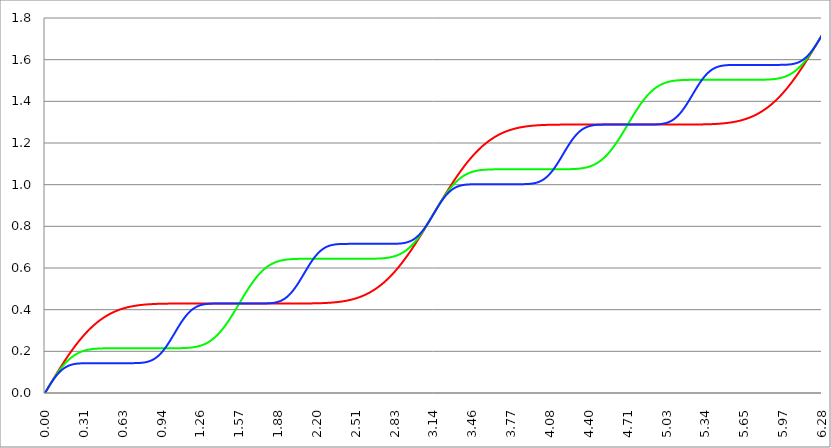
| Category | Series 1 | Series 0 | Series 2 |
|---|---|---|---|
| 0.0 | 0 | 0 | 0 |
| 0.00314159265358979 | 0.003 | 0.003 | 0.003 |
| 0.00628318530717958 | 0.006 | 0.006 | 0.006 |
| 0.00942477796076938 | 0.009 | 0.009 | 0.009 |
| 0.0125663706143592 | 0.013 | 0.013 | 0.013 |
| 0.015707963267949 | 0.016 | 0.016 | 0.016 |
| 0.0188495559215388 | 0.019 | 0.019 | 0.019 |
| 0.0219911485751285 | 0.022 | 0.022 | 0.022 |
| 0.0251327412287183 | 0.025 | 0.025 | 0.025 |
| 0.0282743338823081 | 0.028 | 0.028 | 0.028 |
| 0.0314159265358979 | 0.031 | 0.031 | 0.031 |
| 0.0345575191894877 | 0.035 | 0.034 | 0.034 |
| 0.0376991118430775 | 0.038 | 0.037 | 0.037 |
| 0.0408407044966673 | 0.041 | 0.04 | 0.04 |
| 0.0439822971502571 | 0.044 | 0.044 | 0.043 |
| 0.0471238898038469 | 0.047 | 0.047 | 0.046 |
| 0.0502654824574367 | 0.05 | 0.05 | 0.049 |
| 0.0534070751110265 | 0.053 | 0.053 | 0.052 |
| 0.0565486677646163 | 0.056 | 0.056 | 0.054 |
| 0.059690260418206 | 0.059 | 0.059 | 0.057 |
| 0.0628318530717958 | 0.063 | 0.062 | 0.06 |
| 0.0659734457253856 | 0.066 | 0.064 | 0.063 |
| 0.0691150383789754 | 0.069 | 0.067 | 0.065 |
| 0.0722566310325652 | 0.072 | 0.07 | 0.068 |
| 0.075398223686155 | 0.075 | 0.073 | 0.071 |
| 0.0785398163397448 | 0.078 | 0.076 | 0.073 |
| 0.0816814089933346 | 0.081 | 0.079 | 0.076 |
| 0.0848230016469244 | 0.084 | 0.082 | 0.078 |
| 0.0879645943005142 | 0.087 | 0.084 | 0.08 |
| 0.091106186954104 | 0.09 | 0.087 | 0.083 |
| 0.0942477796076937 | 0.093 | 0.09 | 0.085 |
| 0.0973893722612835 | 0.096 | 0.093 | 0.087 |
| 0.100530964914873 | 0.099 | 0.095 | 0.089 |
| 0.103672557568463 | 0.102 | 0.098 | 0.092 |
| 0.106814150222053 | 0.105 | 0.101 | 0.094 |
| 0.109955742875643 | 0.108 | 0.103 | 0.096 |
| 0.113097335529233 | 0.111 | 0.106 | 0.098 |
| 0.116238928182822 | 0.114 | 0.108 | 0.1 |
| 0.119380520836412 | 0.117 | 0.111 | 0.102 |
| 0.122522113490002 | 0.12 | 0.113 | 0.103 |
| 0.125663706143592 | 0.123 | 0.116 | 0.105 |
| 0.128805298797181 | 0.126 | 0.118 | 0.107 |
| 0.131946891450771 | 0.129 | 0.121 | 0.109 |
| 0.135088484104361 | 0.132 | 0.123 | 0.11 |
| 0.138230076757951 | 0.135 | 0.125 | 0.112 |
| 0.141371669411541 | 0.138 | 0.128 | 0.113 |
| 0.14451326206513 | 0.141 | 0.13 | 0.115 |
| 0.14765485471872 | 0.143 | 0.132 | 0.116 |
| 0.15079644737231 | 0.146 | 0.134 | 0.118 |
| 0.1539380400259 | 0.149 | 0.136 | 0.119 |
| 0.15707963267949 | 0.152 | 0.138 | 0.12 |
| 0.160221225333079 | 0.155 | 0.141 | 0.121 |
| 0.163362817986669 | 0.158 | 0.143 | 0.123 |
| 0.166504410640259 | 0.161 | 0.145 | 0.124 |
| 0.169646003293849 | 0.163 | 0.147 | 0.125 |
| 0.172787595947439 | 0.166 | 0.149 | 0.126 |
| 0.175929188601028 | 0.169 | 0.15 | 0.127 |
| 0.179070781254618 | 0.172 | 0.152 | 0.128 |
| 0.182212373908208 | 0.174 | 0.154 | 0.129 |
| 0.185353966561798 | 0.177 | 0.156 | 0.13 |
| 0.188495559215388 | 0.18 | 0.158 | 0.13 |
| 0.191637151868977 | 0.183 | 0.16 | 0.131 |
| 0.194778744522567 | 0.185 | 0.161 | 0.132 |
| 0.197920337176157 | 0.188 | 0.163 | 0.133 |
| 0.201061929829747 | 0.191 | 0.165 | 0.133 |
| 0.204203522483336 | 0.193 | 0.166 | 0.134 |
| 0.207345115136926 | 0.196 | 0.168 | 0.135 |
| 0.210486707790516 | 0.199 | 0.169 | 0.135 |
| 0.213628300444106 | 0.201 | 0.171 | 0.136 |
| 0.216769893097696 | 0.204 | 0.172 | 0.136 |
| 0.219911485751285 | 0.206 | 0.174 | 0.137 |
| 0.223053078404875 | 0.209 | 0.175 | 0.137 |
| 0.226194671058465 | 0.212 | 0.176 | 0.138 |
| 0.229336263712055 | 0.214 | 0.178 | 0.138 |
| 0.232477856365645 | 0.217 | 0.179 | 0.138 |
| 0.235619449019234 | 0.219 | 0.18 | 0.139 |
| 0.238761041672824 | 0.222 | 0.181 | 0.139 |
| 0.241902634326414 | 0.224 | 0.183 | 0.139 |
| 0.245044226980004 | 0.227 | 0.184 | 0.14 |
| 0.248185819633594 | 0.229 | 0.185 | 0.14 |
| 0.251327412287183 | 0.232 | 0.186 | 0.14 |
| 0.254469004940773 | 0.234 | 0.187 | 0.141 |
| 0.257610597594363 | 0.236 | 0.188 | 0.141 |
| 0.260752190247953 | 0.239 | 0.189 | 0.141 |
| 0.263893782901543 | 0.241 | 0.19 | 0.141 |
| 0.267035375555132 | 0.244 | 0.191 | 0.141 |
| 0.270176968208722 | 0.246 | 0.192 | 0.142 |
| 0.273318560862312 | 0.248 | 0.193 | 0.142 |
| 0.276460153515902 | 0.251 | 0.194 | 0.142 |
| 0.279601746169492 | 0.253 | 0.195 | 0.142 |
| 0.282743338823082 | 0.255 | 0.196 | 0.142 |
| 0.285884931476671 | 0.257 | 0.196 | 0.142 |
| 0.289026524130261 | 0.26 | 0.197 | 0.142 |
| 0.292168116783851 | 0.262 | 0.198 | 0.142 |
| 0.295309709437441 | 0.264 | 0.199 | 0.142 |
| 0.298451302091031 | 0.266 | 0.199 | 0.143 |
| 0.30159289474462 | 0.268 | 0.2 | 0.143 |
| 0.30473448739821 | 0.271 | 0.201 | 0.143 |
| 0.3078760800518 | 0.273 | 0.201 | 0.143 |
| 0.31101767270539 | 0.275 | 0.202 | 0.143 |
| 0.31415926535898 | 0.277 | 0.202 | 0.143 |
| 0.31730085801257 | 0.279 | 0.203 | 0.143 |
| 0.320442450666159 | 0.281 | 0.204 | 0.143 |
| 0.323584043319749 | 0.283 | 0.204 | 0.143 |
| 0.326725635973339 | 0.285 | 0.205 | 0.143 |
| 0.329867228626929 | 0.287 | 0.205 | 0.143 |
| 0.333008821280519 | 0.289 | 0.206 | 0.143 |
| 0.336150413934108 | 0.291 | 0.206 | 0.143 |
| 0.339292006587698 | 0.293 | 0.206 | 0.143 |
| 0.342433599241288 | 0.295 | 0.207 | 0.143 |
| 0.345575191894878 | 0.297 | 0.207 | 0.143 |
| 0.348716784548468 | 0.299 | 0.208 | 0.143 |
| 0.351858377202058 | 0.301 | 0.208 | 0.143 |
| 0.354999969855647 | 0.303 | 0.208 | 0.143 |
| 0.358141562509237 | 0.305 | 0.209 | 0.143 |
| 0.361283155162827 | 0.307 | 0.209 | 0.143 |
| 0.364424747816417 | 0.308 | 0.209 | 0.143 |
| 0.367566340470007 | 0.31 | 0.21 | 0.143 |
| 0.370707933123597 | 0.312 | 0.21 | 0.143 |
| 0.373849525777186 | 0.314 | 0.21 | 0.143 |
| 0.376991118430776 | 0.316 | 0.21 | 0.143 |
| 0.380132711084366 | 0.317 | 0.211 | 0.143 |
| 0.383274303737956 | 0.319 | 0.211 | 0.143 |
| 0.386415896391546 | 0.321 | 0.211 | 0.143 |
| 0.389557489045135 | 0.322 | 0.211 | 0.143 |
| 0.392699081698725 | 0.324 | 0.212 | 0.143 |
| 0.395840674352315 | 0.326 | 0.212 | 0.143 |
| 0.398982267005905 | 0.327 | 0.212 | 0.143 |
| 0.402123859659495 | 0.329 | 0.212 | 0.143 |
| 0.405265452313085 | 0.331 | 0.212 | 0.143 |
| 0.408407044966674 | 0.332 | 0.212 | 0.143 |
| 0.411548637620264 | 0.334 | 0.213 | 0.143 |
| 0.414690230273854 | 0.335 | 0.213 | 0.143 |
| 0.417831822927444 | 0.337 | 0.213 | 0.143 |
| 0.420973415581034 | 0.338 | 0.213 | 0.143 |
| 0.424115008234623 | 0.34 | 0.213 | 0.143 |
| 0.427256600888213 | 0.341 | 0.213 | 0.143 |
| 0.430398193541803 | 0.343 | 0.213 | 0.143 |
| 0.433539786195393 | 0.344 | 0.213 | 0.143 |
| 0.436681378848983 | 0.346 | 0.213 | 0.143 |
| 0.439822971502573 | 0.347 | 0.214 | 0.143 |
| 0.442964564156162 | 0.349 | 0.214 | 0.143 |
| 0.446106156809752 | 0.35 | 0.214 | 0.143 |
| 0.449247749463342 | 0.351 | 0.214 | 0.143 |
| 0.452389342116932 | 0.353 | 0.214 | 0.143 |
| 0.455530934770522 | 0.354 | 0.214 | 0.143 |
| 0.458672527424111 | 0.355 | 0.214 | 0.143 |
| 0.461814120077701 | 0.357 | 0.214 | 0.143 |
| 0.464955712731291 | 0.358 | 0.214 | 0.143 |
| 0.468097305384881 | 0.359 | 0.214 | 0.143 |
| 0.471238898038471 | 0.36 | 0.214 | 0.143 |
| 0.474380490692061 | 0.362 | 0.214 | 0.143 |
| 0.47752208334565 | 0.363 | 0.214 | 0.143 |
| 0.48066367599924 | 0.364 | 0.214 | 0.143 |
| 0.48380526865283 | 0.365 | 0.214 | 0.143 |
| 0.48694686130642 | 0.367 | 0.214 | 0.143 |
| 0.49008845396001 | 0.368 | 0.214 | 0.143 |
| 0.493230046613599 | 0.369 | 0.214 | 0.143 |
| 0.496371639267189 | 0.37 | 0.214 | 0.143 |
| 0.499513231920779 | 0.371 | 0.215 | 0.143 |
| 0.502654824574369 | 0.372 | 0.215 | 0.143 |
| 0.505796417227959 | 0.373 | 0.215 | 0.143 |
| 0.508938009881549 | 0.374 | 0.215 | 0.143 |
| 0.512079602535138 | 0.375 | 0.215 | 0.143 |
| 0.515221195188728 | 0.376 | 0.215 | 0.143 |
| 0.518362787842318 | 0.377 | 0.215 | 0.143 |
| 0.521504380495908 | 0.378 | 0.215 | 0.143 |
| 0.524645973149498 | 0.379 | 0.215 | 0.143 |
| 0.527787565803087 | 0.38 | 0.215 | 0.143 |
| 0.530929158456677 | 0.381 | 0.215 | 0.143 |
| 0.534070751110267 | 0.382 | 0.215 | 0.143 |
| 0.537212343763857 | 0.383 | 0.215 | 0.143 |
| 0.540353936417447 | 0.384 | 0.215 | 0.143 |
| 0.543495529071037 | 0.385 | 0.215 | 0.143 |
| 0.546637121724626 | 0.386 | 0.215 | 0.143 |
| 0.549778714378216 | 0.387 | 0.215 | 0.143 |
| 0.552920307031806 | 0.388 | 0.215 | 0.143 |
| 0.556061899685396 | 0.389 | 0.215 | 0.143 |
| 0.559203492338986 | 0.389 | 0.215 | 0.143 |
| 0.562345084992576 | 0.39 | 0.215 | 0.143 |
| 0.565486677646165 | 0.391 | 0.215 | 0.143 |
| 0.568628270299755 | 0.392 | 0.215 | 0.143 |
| 0.571769862953345 | 0.393 | 0.215 | 0.143 |
| 0.574911455606935 | 0.394 | 0.215 | 0.143 |
| 0.578053048260525 | 0.394 | 0.215 | 0.143 |
| 0.581194640914114 | 0.395 | 0.215 | 0.143 |
| 0.584336233567704 | 0.396 | 0.215 | 0.143 |
| 0.587477826221294 | 0.397 | 0.215 | 0.143 |
| 0.590619418874884 | 0.397 | 0.215 | 0.143 |
| 0.593761011528474 | 0.398 | 0.215 | 0.143 |
| 0.596902604182064 | 0.399 | 0.215 | 0.143 |
| 0.600044196835653 | 0.399 | 0.215 | 0.143 |
| 0.603185789489243 | 0.4 | 0.215 | 0.143 |
| 0.606327382142833 | 0.401 | 0.215 | 0.143 |
| 0.609468974796423 | 0.401 | 0.215 | 0.143 |
| 0.612610567450013 | 0.402 | 0.215 | 0.143 |
| 0.615752160103602 | 0.403 | 0.215 | 0.143 |
| 0.618893752757192 | 0.403 | 0.215 | 0.143 |
| 0.622035345410782 | 0.404 | 0.215 | 0.143 |
| 0.625176938064372 | 0.404 | 0.215 | 0.143 |
| 0.628318530717962 | 0.405 | 0.215 | 0.143 |
| 0.631460123371551 | 0.406 | 0.215 | 0.143 |
| 0.634601716025141 | 0.406 | 0.215 | 0.143 |
| 0.637743308678731 | 0.407 | 0.215 | 0.143 |
| 0.640884901332321 | 0.407 | 0.215 | 0.143 |
| 0.644026493985911 | 0.408 | 0.215 | 0.143 |
| 0.647168086639501 | 0.408 | 0.215 | 0.143 |
| 0.65030967929309 | 0.409 | 0.215 | 0.143 |
| 0.65345127194668 | 0.409 | 0.215 | 0.143 |
| 0.65659286460027 | 0.41 | 0.215 | 0.143 |
| 0.65973445725386 | 0.41 | 0.215 | 0.143 |
| 0.66287604990745 | 0.411 | 0.215 | 0.143 |
| 0.666017642561039 | 0.411 | 0.215 | 0.143 |
| 0.669159235214629 | 0.412 | 0.215 | 0.143 |
| 0.672300827868219 | 0.412 | 0.215 | 0.143 |
| 0.675442420521809 | 0.412 | 0.215 | 0.143 |
| 0.678584013175399 | 0.413 | 0.215 | 0.143 |
| 0.681725605828989 | 0.413 | 0.215 | 0.143 |
| 0.684867198482578 | 0.414 | 0.215 | 0.143 |
| 0.688008791136168 | 0.414 | 0.215 | 0.143 |
| 0.691150383789758 | 0.415 | 0.215 | 0.143 |
| 0.694291976443348 | 0.415 | 0.215 | 0.143 |
| 0.697433569096938 | 0.415 | 0.215 | 0.143 |
| 0.700575161750528 | 0.416 | 0.215 | 0.143 |
| 0.703716754404117 | 0.416 | 0.215 | 0.143 |
| 0.706858347057707 | 0.416 | 0.215 | 0.143 |
| 0.709999939711297 | 0.417 | 0.215 | 0.143 |
| 0.713141532364887 | 0.417 | 0.215 | 0.143 |
| 0.716283125018477 | 0.417 | 0.215 | 0.143 |
| 0.719424717672066 | 0.418 | 0.215 | 0.143 |
| 0.722566310325656 | 0.418 | 0.215 | 0.143 |
| 0.725707902979246 | 0.418 | 0.215 | 0.143 |
| 0.728849495632836 | 0.419 | 0.215 | 0.143 |
| 0.731991088286426 | 0.419 | 0.215 | 0.144 |
| 0.735132680940016 | 0.419 | 0.215 | 0.144 |
| 0.738274273593605 | 0.42 | 0.215 | 0.144 |
| 0.741415866247195 | 0.42 | 0.215 | 0.144 |
| 0.744557458900785 | 0.42 | 0.215 | 0.144 |
| 0.747699051554375 | 0.42 | 0.215 | 0.144 |
| 0.750840644207965 | 0.421 | 0.215 | 0.144 |
| 0.753982236861554 | 0.421 | 0.215 | 0.144 |
| 0.757123829515144 | 0.421 | 0.215 | 0.144 |
| 0.760265422168734 | 0.421 | 0.215 | 0.144 |
| 0.763407014822324 | 0.422 | 0.215 | 0.144 |
| 0.766548607475914 | 0.422 | 0.215 | 0.144 |
| 0.769690200129504 | 0.422 | 0.215 | 0.144 |
| 0.772831792783093 | 0.422 | 0.215 | 0.145 |
| 0.775973385436683 | 0.422 | 0.215 | 0.145 |
| 0.779114978090273 | 0.423 | 0.215 | 0.145 |
| 0.782256570743863 | 0.423 | 0.215 | 0.145 |
| 0.785398163397453 | 0.423 | 0.215 | 0.145 |
| 0.788539756051042 | 0.423 | 0.215 | 0.146 |
| 0.791681348704632 | 0.423 | 0.215 | 0.146 |
| 0.794822941358222 | 0.424 | 0.215 | 0.146 |
| 0.797964534011812 | 0.424 | 0.215 | 0.146 |
| 0.801106126665402 | 0.424 | 0.215 | 0.146 |
| 0.804247719318992 | 0.424 | 0.215 | 0.147 |
| 0.807389311972581 | 0.424 | 0.215 | 0.147 |
| 0.810530904626171 | 0.425 | 0.215 | 0.147 |
| 0.813672497279761 | 0.425 | 0.215 | 0.148 |
| 0.816814089933351 | 0.425 | 0.215 | 0.148 |
| 0.819955682586941 | 0.425 | 0.215 | 0.149 |
| 0.823097275240531 | 0.425 | 0.215 | 0.149 |
| 0.82623886789412 | 0.425 | 0.215 | 0.149 |
| 0.82938046054771 | 0.425 | 0.215 | 0.15 |
| 0.8325220532013 | 0.426 | 0.215 | 0.15 |
| 0.83566364585489 | 0.426 | 0.215 | 0.151 |
| 0.83880523850848 | 0.426 | 0.215 | 0.152 |
| 0.841946831162069 | 0.426 | 0.215 | 0.152 |
| 0.845088423815659 | 0.426 | 0.215 | 0.153 |
| 0.848230016469249 | 0.426 | 0.215 | 0.153 |
| 0.851371609122839 | 0.426 | 0.215 | 0.154 |
| 0.854513201776429 | 0.426 | 0.215 | 0.155 |
| 0.857654794430019 | 0.426 | 0.215 | 0.156 |
| 0.860796387083608 | 0.427 | 0.215 | 0.157 |
| 0.863937979737198 | 0.427 | 0.215 | 0.157 |
| 0.867079572390788 | 0.427 | 0.215 | 0.158 |
| 0.870221165044378 | 0.427 | 0.215 | 0.159 |
| 0.873362757697968 | 0.427 | 0.215 | 0.16 |
| 0.876504350351557 | 0.427 | 0.215 | 0.161 |
| 0.879645943005147 | 0.427 | 0.215 | 0.162 |
| 0.882787535658737 | 0.427 | 0.215 | 0.163 |
| 0.885929128312327 | 0.427 | 0.215 | 0.165 |
| 0.889070720965917 | 0.427 | 0.215 | 0.166 |
| 0.892212313619507 | 0.427 | 0.215 | 0.167 |
| 0.895353906273096 | 0.428 | 0.215 | 0.168 |
| 0.898495498926686 | 0.428 | 0.215 | 0.17 |
| 0.901637091580276 | 0.428 | 0.215 | 0.171 |
| 0.904778684233866 | 0.428 | 0.215 | 0.173 |
| 0.907920276887456 | 0.428 | 0.215 | 0.174 |
| 0.911061869541045 | 0.428 | 0.215 | 0.176 |
| 0.914203462194635 | 0.428 | 0.215 | 0.177 |
| 0.917345054848225 | 0.428 | 0.215 | 0.179 |
| 0.920486647501815 | 0.428 | 0.215 | 0.181 |
| 0.923628240155405 | 0.428 | 0.215 | 0.182 |
| 0.926769832808995 | 0.428 | 0.215 | 0.184 |
| 0.929911425462584 | 0.428 | 0.215 | 0.186 |
| 0.933053018116174 | 0.428 | 0.215 | 0.188 |
| 0.936194610769764 | 0.428 | 0.215 | 0.19 |
| 0.939336203423354 | 0.428 | 0.215 | 0.192 |
| 0.942477796076944 | 0.428 | 0.215 | 0.194 |
| 0.945619388730533 | 0.428 | 0.215 | 0.196 |
| 0.948760981384123 | 0.429 | 0.215 | 0.198 |
| 0.951902574037713 | 0.429 | 0.215 | 0.201 |
| 0.955044166691303 | 0.429 | 0.215 | 0.203 |
| 0.958185759344893 | 0.429 | 0.215 | 0.205 |
| 0.961327351998483 | 0.429 | 0.215 | 0.208 |
| 0.964468944652072 | 0.429 | 0.215 | 0.21 |
| 0.967610537305662 | 0.429 | 0.215 | 0.212 |
| 0.970752129959252 | 0.429 | 0.215 | 0.215 |
| 0.973893722612842 | 0.429 | 0.215 | 0.218 |
| 0.977035315266432 | 0.429 | 0.215 | 0.22 |
| 0.980176907920022 | 0.429 | 0.215 | 0.223 |
| 0.983318500573611 | 0.429 | 0.215 | 0.225 |
| 0.986460093227201 | 0.429 | 0.215 | 0.228 |
| 0.989601685880791 | 0.429 | 0.215 | 0.231 |
| 0.992743278534381 | 0.429 | 0.215 | 0.234 |
| 0.995884871187971 | 0.429 | 0.215 | 0.237 |
| 0.99902646384156 | 0.429 | 0.215 | 0.239 |
| 1.00216805649515 | 0.429 | 0.215 | 0.242 |
| 1.00530964914874 | 0.429 | 0.215 | 0.245 |
| 1.00845124180233 | 0.429 | 0.215 | 0.248 |
| 1.01159283445592 | 0.429 | 0.215 | 0.251 |
| 1.01473442710951 | 0.429 | 0.215 | 0.254 |
| 1.017876019763099 | 0.429 | 0.215 | 0.257 |
| 1.021017612416689 | 0.429 | 0.215 | 0.26 |
| 1.02415920507028 | 0.429 | 0.215 | 0.263 |
| 1.027300797723869 | 0.429 | 0.215 | 0.267 |
| 1.030442390377459 | 0.429 | 0.215 | 0.27 |
| 1.033583983031048 | 0.429 | 0.215 | 0.273 |
| 1.036725575684638 | 0.429 | 0.215 | 0.276 |
| 1.039867168338228 | 0.429 | 0.215 | 0.279 |
| 1.043008760991818 | 0.429 | 0.215 | 0.282 |
| 1.046150353645408 | 0.429 | 0.215 | 0.285 |
| 1.049291946298998 | 0.429 | 0.215 | 0.288 |
| 1.052433538952587 | 0.429 | 0.215 | 0.292 |
| 1.055575131606177 | 0.429 | 0.215 | 0.295 |
| 1.058716724259767 | 0.429 | 0.215 | 0.298 |
| 1.061858316913357 | 0.429 | 0.215 | 0.301 |
| 1.064999909566947 | 0.429 | 0.215 | 0.304 |
| 1.068141502220536 | 0.429 | 0.215 | 0.307 |
| 1.071283094874126 | 0.429 | 0.215 | 0.31 |
| 1.074424687527716 | 0.429 | 0.215 | 0.313 |
| 1.077566280181306 | 0.429 | 0.215 | 0.316 |
| 1.080707872834896 | 0.429 | 0.215 | 0.319 |
| 1.083849465488486 | 0.429 | 0.215 | 0.322 |
| 1.086991058142075 | 0.429 | 0.215 | 0.325 |
| 1.090132650795665 | 0.429 | 0.215 | 0.328 |
| 1.093274243449255 | 0.429 | 0.215 | 0.331 |
| 1.096415836102845 | 0.429 | 0.215 | 0.334 |
| 1.099557428756435 | 0.429 | 0.215 | 0.337 |
| 1.102699021410025 | 0.429 | 0.215 | 0.34 |
| 1.105840614063614 | 0.429 | 0.215 | 0.343 |
| 1.108982206717204 | 0.429 | 0.215 | 0.345 |
| 1.112123799370794 | 0.429 | 0.216 | 0.348 |
| 1.115265392024384 | 0.429 | 0.216 | 0.351 |
| 1.118406984677974 | 0.429 | 0.216 | 0.353 |
| 1.121548577331563 | 0.429 | 0.216 | 0.356 |
| 1.124690169985153 | 0.429 | 0.216 | 0.359 |
| 1.127831762638743 | 0.429 | 0.216 | 0.361 |
| 1.130973355292333 | 0.429 | 0.216 | 0.364 |
| 1.134114947945923 | 0.429 | 0.216 | 0.366 |
| 1.137256540599513 | 0.429 | 0.216 | 0.368 |
| 1.140398133253102 | 0.429 | 0.216 | 0.371 |
| 1.143539725906692 | 0.429 | 0.216 | 0.373 |
| 1.146681318560282 | 0.429 | 0.216 | 0.375 |
| 1.149822911213872 | 0.429 | 0.217 | 0.377 |
| 1.152964503867462 | 0.429 | 0.217 | 0.379 |
| 1.156106096521051 | 0.429 | 0.217 | 0.381 |
| 1.159247689174641 | 0.429 | 0.217 | 0.383 |
| 1.162389281828231 | 0.429 | 0.217 | 0.385 |
| 1.165530874481821 | 0.429 | 0.217 | 0.387 |
| 1.168672467135411 | 0.429 | 0.217 | 0.389 |
| 1.171814059789001 | 0.429 | 0.218 | 0.391 |
| 1.17495565244259 | 0.429 | 0.218 | 0.393 |
| 1.17809724509618 | 0.429 | 0.218 | 0.394 |
| 1.18123883774977 | 0.429 | 0.218 | 0.396 |
| 1.18438043040336 | 0.429 | 0.218 | 0.398 |
| 1.18752202305695 | 0.429 | 0.219 | 0.399 |
| 1.190663615710539 | 0.429 | 0.219 | 0.401 |
| 1.193805208364129 | 0.429 | 0.219 | 0.402 |
| 1.19694680101772 | 0.43 | 0.219 | 0.403 |
| 1.200088393671309 | 0.43 | 0.22 | 0.405 |
| 1.203229986324899 | 0.43 | 0.22 | 0.406 |
| 1.206371578978489 | 0.43 | 0.22 | 0.407 |
| 1.209513171632078 | 0.43 | 0.22 | 0.409 |
| 1.212654764285668 | 0.43 | 0.221 | 0.41 |
| 1.215796356939258 | 0.43 | 0.221 | 0.411 |
| 1.218937949592848 | 0.43 | 0.222 | 0.412 |
| 1.222079542246438 | 0.43 | 0.222 | 0.413 |
| 1.225221134900027 | 0.43 | 0.222 | 0.414 |
| 1.228362727553617 | 0.43 | 0.223 | 0.415 |
| 1.231504320207207 | 0.43 | 0.223 | 0.416 |
| 1.234645912860797 | 0.43 | 0.223 | 0.416 |
| 1.237787505514387 | 0.43 | 0.224 | 0.417 |
| 1.240929098167977 | 0.43 | 0.224 | 0.418 |
| 1.244070690821566 | 0.43 | 0.225 | 0.419 |
| 1.247212283475156 | 0.43 | 0.225 | 0.419 |
| 1.250353876128746 | 0.43 | 0.226 | 0.42 |
| 1.253495468782336 | 0.43 | 0.226 | 0.421 |
| 1.256637061435926 | 0.43 | 0.227 | 0.421 |
| 1.259778654089515 | 0.43 | 0.228 | 0.422 |
| 1.262920246743105 | 0.43 | 0.228 | 0.422 |
| 1.266061839396695 | 0.43 | 0.229 | 0.423 |
| 1.269203432050285 | 0.43 | 0.23 | 0.423 |
| 1.272345024703875 | 0.43 | 0.23 | 0.424 |
| 1.275486617357465 | 0.43 | 0.231 | 0.424 |
| 1.278628210011054 | 0.43 | 0.232 | 0.425 |
| 1.281769802664644 | 0.43 | 0.232 | 0.425 |
| 1.284911395318234 | 0.43 | 0.233 | 0.425 |
| 1.288052987971824 | 0.43 | 0.234 | 0.426 |
| 1.291194580625414 | 0.43 | 0.235 | 0.426 |
| 1.294336173279003 | 0.43 | 0.236 | 0.426 |
| 1.297477765932593 | 0.43 | 0.236 | 0.427 |
| 1.300619358586183 | 0.43 | 0.237 | 0.427 |
| 1.303760951239773 | 0.43 | 0.238 | 0.427 |
| 1.306902543893363 | 0.43 | 0.239 | 0.427 |
| 1.310044136546953 | 0.43 | 0.24 | 0.427 |
| 1.313185729200542 | 0.43 | 0.241 | 0.428 |
| 1.316327321854132 | 0.43 | 0.242 | 0.428 |
| 1.319468914507722 | 0.43 | 0.243 | 0.428 |
| 1.322610507161312 | 0.43 | 0.245 | 0.428 |
| 1.325752099814902 | 0.43 | 0.246 | 0.428 |
| 1.328893692468491 | 0.43 | 0.247 | 0.428 |
| 1.332035285122081 | 0.43 | 0.248 | 0.428 |
| 1.335176877775671 | 0.43 | 0.249 | 0.429 |
| 1.338318470429261 | 0.43 | 0.251 | 0.429 |
| 1.341460063082851 | 0.43 | 0.252 | 0.429 |
| 1.344601655736441 | 0.43 | 0.253 | 0.429 |
| 1.34774324839003 | 0.43 | 0.255 | 0.429 |
| 1.35088484104362 | 0.43 | 0.256 | 0.429 |
| 1.35402643369721 | 0.43 | 0.257 | 0.429 |
| 1.3571680263508 | 0.43 | 0.259 | 0.429 |
| 1.36030961900439 | 0.43 | 0.26 | 0.429 |
| 1.363451211657979 | 0.43 | 0.262 | 0.429 |
| 1.36659280431157 | 0.43 | 0.263 | 0.429 |
| 1.369734396965159 | 0.43 | 0.265 | 0.429 |
| 1.372875989618749 | 0.43 | 0.267 | 0.429 |
| 1.376017582272339 | 0.43 | 0.268 | 0.429 |
| 1.379159174925929 | 0.43 | 0.27 | 0.429 |
| 1.382300767579518 | 0.43 | 0.272 | 0.429 |
| 1.385442360233108 | 0.43 | 0.274 | 0.429 |
| 1.388583952886698 | 0.43 | 0.275 | 0.429 |
| 1.391725545540288 | 0.43 | 0.277 | 0.429 |
| 1.394867138193878 | 0.43 | 0.279 | 0.429 |
| 1.398008730847468 | 0.43 | 0.281 | 0.429 |
| 1.401150323501057 | 0.43 | 0.283 | 0.429 |
| 1.404291916154647 | 0.43 | 0.285 | 0.429 |
| 1.407433508808237 | 0.43 | 0.287 | 0.429 |
| 1.410575101461827 | 0.43 | 0.289 | 0.429 |
| 1.413716694115417 | 0.43 | 0.291 | 0.429 |
| 1.416858286769006 | 0.43 | 0.293 | 0.429 |
| 1.419999879422596 | 0.43 | 0.295 | 0.429 |
| 1.423141472076186 | 0.43 | 0.297 | 0.429 |
| 1.426283064729776 | 0.43 | 0.3 | 0.429 |
| 1.429424657383366 | 0.43 | 0.302 | 0.43 |
| 1.432566250036956 | 0.43 | 0.304 | 0.43 |
| 1.435707842690545 | 0.43 | 0.307 | 0.43 |
| 1.438849435344135 | 0.43 | 0.309 | 0.43 |
| 1.441991027997725 | 0.43 | 0.311 | 0.43 |
| 1.445132620651315 | 0.43 | 0.314 | 0.43 |
| 1.448274213304905 | 0.43 | 0.316 | 0.43 |
| 1.451415805958494 | 0.43 | 0.319 | 0.43 |
| 1.454557398612084 | 0.43 | 0.321 | 0.43 |
| 1.457698991265674 | 0.43 | 0.324 | 0.43 |
| 1.460840583919264 | 0.43 | 0.326 | 0.43 |
| 1.463982176572854 | 0.43 | 0.329 | 0.43 |
| 1.467123769226444 | 0.43 | 0.332 | 0.43 |
| 1.470265361880033 | 0.43 | 0.334 | 0.43 |
| 1.473406954533623 | 0.43 | 0.337 | 0.43 |
| 1.476548547187213 | 0.43 | 0.34 | 0.43 |
| 1.479690139840803 | 0.43 | 0.342 | 0.43 |
| 1.482831732494393 | 0.43 | 0.345 | 0.43 |
| 1.485973325147982 | 0.43 | 0.348 | 0.43 |
| 1.489114917801572 | 0.43 | 0.351 | 0.43 |
| 1.492256510455162 | 0.43 | 0.353 | 0.43 |
| 1.495398103108752 | 0.43 | 0.356 | 0.43 |
| 1.498539695762342 | 0.43 | 0.359 | 0.43 |
| 1.501681288415932 | 0.43 | 0.362 | 0.43 |
| 1.504822881069521 | 0.43 | 0.365 | 0.43 |
| 1.507964473723111 | 0.43 | 0.368 | 0.43 |
| 1.511106066376701 | 0.43 | 0.371 | 0.43 |
| 1.514247659030291 | 0.43 | 0.374 | 0.43 |
| 1.517389251683881 | 0.43 | 0.377 | 0.43 |
| 1.520530844337471 | 0.43 | 0.38 | 0.43 |
| 1.52367243699106 | 0.43 | 0.383 | 0.43 |
| 1.52681402964465 | 0.43 | 0.386 | 0.43 |
| 1.52995562229824 | 0.43 | 0.389 | 0.43 |
| 1.53309721495183 | 0.43 | 0.392 | 0.43 |
| 1.53623880760542 | 0.43 | 0.395 | 0.43 |
| 1.539380400259009 | 0.43 | 0.398 | 0.43 |
| 1.542521992912599 | 0.43 | 0.401 | 0.43 |
| 1.545663585566189 | 0.43 | 0.404 | 0.43 |
| 1.548805178219779 | 0.43 | 0.408 | 0.43 |
| 1.551946770873369 | 0.43 | 0.411 | 0.43 |
| 1.555088363526959 | 0.43 | 0.414 | 0.43 |
| 1.558229956180548 | 0.43 | 0.417 | 0.43 |
| 1.561371548834138 | 0.43 | 0.42 | 0.43 |
| 1.564513141487728 | 0.43 | 0.423 | 0.43 |
| 1.567654734141318 | 0.43 | 0.426 | 0.43 |
| 1.570796326794908 | 0.43 | 0.43 | 0.43 |
| 1.573937919448497 | 0.43 | 0.433 | 0.43 |
| 1.577079512102087 | 0.43 | 0.436 | 0.43 |
| 1.580221104755677 | 0.43 | 0.439 | 0.43 |
| 1.583362697409267 | 0.43 | 0.442 | 0.43 |
| 1.586504290062857 | 0.43 | 0.445 | 0.43 |
| 1.589645882716447 | 0.43 | 0.448 | 0.43 |
| 1.592787475370036 | 0.43 | 0.451 | 0.43 |
| 1.595929068023626 | 0.43 | 0.455 | 0.43 |
| 1.599070660677216 | 0.43 | 0.458 | 0.43 |
| 1.602212253330806 | 0.43 | 0.461 | 0.43 |
| 1.605353845984396 | 0.43 | 0.464 | 0.43 |
| 1.608495438637985 | 0.43 | 0.467 | 0.43 |
| 1.611637031291575 | 0.43 | 0.47 | 0.43 |
| 1.614778623945165 | 0.43 | 0.473 | 0.43 |
| 1.617920216598755 | 0.43 | 0.476 | 0.43 |
| 1.621061809252345 | 0.43 | 0.479 | 0.43 |
| 1.624203401905935 | 0.43 | 0.482 | 0.43 |
| 1.627344994559524 | 0.43 | 0.485 | 0.43 |
| 1.630486587213114 | 0.43 | 0.488 | 0.43 |
| 1.633628179866704 | 0.43 | 0.491 | 0.43 |
| 1.636769772520294 | 0.43 | 0.494 | 0.43 |
| 1.639911365173884 | 0.43 | 0.497 | 0.43 |
| 1.643052957827473 | 0.43 | 0.5 | 0.43 |
| 1.646194550481063 | 0.43 | 0.503 | 0.43 |
| 1.649336143134653 | 0.43 | 0.506 | 0.43 |
| 1.652477735788243 | 0.43 | 0.508 | 0.43 |
| 1.655619328441833 | 0.43 | 0.511 | 0.43 |
| 1.658760921095423 | 0.43 | 0.514 | 0.43 |
| 1.661902513749012 | 0.43 | 0.517 | 0.43 |
| 1.665044106402602 | 0.43 | 0.519 | 0.43 |
| 1.668185699056192 | 0.43 | 0.522 | 0.43 |
| 1.671327291709782 | 0.43 | 0.525 | 0.43 |
| 1.674468884363372 | 0.43 | 0.528 | 0.43 |
| 1.677610477016961 | 0.43 | 0.53 | 0.43 |
| 1.680752069670551 | 0.43 | 0.533 | 0.43 |
| 1.683893662324141 | 0.43 | 0.535 | 0.43 |
| 1.687035254977731 | 0.43 | 0.538 | 0.43 |
| 1.690176847631321 | 0.43 | 0.54 | 0.43 |
| 1.693318440284911 | 0.43 | 0.543 | 0.43 |
| 1.6964600329385 | 0.43 | 0.545 | 0.43 |
| 1.69960162559209 | 0.43 | 0.548 | 0.43 |
| 1.70274321824568 | 0.43 | 0.55 | 0.43 |
| 1.70588481089927 | 0.43 | 0.552 | 0.43 |
| 1.70902640355286 | 0.43 | 0.555 | 0.43 |
| 1.712167996206449 | 0.43 | 0.557 | 0.43 |
| 1.715309588860039 | 0.43 | 0.559 | 0.43 |
| 1.71845118151363 | 0.43 | 0.562 | 0.43 |
| 1.721592774167219 | 0.43 | 0.564 | 0.43 |
| 1.724734366820809 | 0.43 | 0.566 | 0.43 |
| 1.727875959474399 | 0.43 | 0.568 | 0.43 |
| 1.731017552127988 | 0.43 | 0.57 | 0.43 |
| 1.734159144781578 | 0.43 | 0.572 | 0.43 |
| 1.737300737435168 | 0.43 | 0.574 | 0.43 |
| 1.740442330088758 | 0.43 | 0.576 | 0.43 |
| 1.743583922742348 | 0.43 | 0.578 | 0.43 |
| 1.746725515395937 | 0.43 | 0.58 | 0.43 |
| 1.749867108049527 | 0.43 | 0.582 | 0.43 |
| 1.753008700703117 | 0.43 | 0.584 | 0.43 |
| 1.756150293356707 | 0.43 | 0.586 | 0.43 |
| 1.759291886010297 | 0.43 | 0.587 | 0.43 |
| 1.762433478663887 | 0.43 | 0.589 | 0.43 |
| 1.765575071317476 | 0.43 | 0.591 | 0.43 |
| 1.768716663971066 | 0.43 | 0.592 | 0.43 |
| 1.771858256624656 | 0.43 | 0.594 | 0.43 |
| 1.774999849278246 | 0.43 | 0.596 | 0.43 |
| 1.778141441931836 | 0.43 | 0.597 | 0.43 |
| 1.781283034585426 | 0.43 | 0.599 | 0.43 |
| 1.784424627239015 | 0.43 | 0.6 | 0.43 |
| 1.787566219892605 | 0.43 | 0.602 | 0.43 |
| 1.790707812546195 | 0.43 | 0.603 | 0.43 |
| 1.793849405199785 | 0.43 | 0.605 | 0.43 |
| 1.796990997853375 | 0.43 | 0.606 | 0.43 |
| 1.800132590506964 | 0.43 | 0.607 | 0.43 |
| 1.803274183160554 | 0.43 | 0.608 | 0.43 |
| 1.806415775814144 | 0.43 | 0.61 | 0.43 |
| 1.809557368467734 | 0.43 | 0.611 | 0.431 |
| 1.812698961121324 | 0.43 | 0.612 | 0.431 |
| 1.815840553774914 | 0.43 | 0.613 | 0.431 |
| 1.818982146428503 | 0.43 | 0.614 | 0.431 |
| 1.822123739082093 | 0.43 | 0.616 | 0.431 |
| 1.825265331735683 | 0.43 | 0.617 | 0.431 |
| 1.828406924389273 | 0.43 | 0.618 | 0.431 |
| 1.831548517042863 | 0.43 | 0.619 | 0.432 |
| 1.834690109696452 | 0.43 | 0.62 | 0.432 |
| 1.837831702350042 | 0.43 | 0.621 | 0.432 |
| 1.840973295003632 | 0.43 | 0.622 | 0.432 |
| 1.844114887657222 | 0.43 | 0.623 | 0.432 |
| 1.847256480310812 | 0.43 | 0.623 | 0.433 |
| 1.850398072964402 | 0.43 | 0.624 | 0.433 |
| 1.853539665617991 | 0.43 | 0.625 | 0.433 |
| 1.856681258271581 | 0.43 | 0.626 | 0.434 |
| 1.859822850925171 | 0.43 | 0.627 | 0.434 |
| 1.862964443578761 | 0.43 | 0.627 | 0.434 |
| 1.866106036232351 | 0.43 | 0.628 | 0.435 |
| 1.86924762888594 | 0.43 | 0.629 | 0.435 |
| 1.87238922153953 | 0.43 | 0.63 | 0.436 |
| 1.87553081419312 | 0.43 | 0.63 | 0.436 |
| 1.87867240684671 | 0.43 | 0.631 | 0.437 |
| 1.8818139995003 | 0.43 | 0.631 | 0.437 |
| 1.88495559215389 | 0.43 | 0.632 | 0.438 |
| 1.888097184807479 | 0.43 | 0.633 | 0.438 |
| 1.891238777461069 | 0.43 | 0.633 | 0.439 |
| 1.89438037011466 | 0.43 | 0.634 | 0.44 |
| 1.897521962768249 | 0.43 | 0.634 | 0.44 |
| 1.900663555421839 | 0.43 | 0.635 | 0.441 |
| 1.903805148075429 | 0.43 | 0.635 | 0.442 |
| 1.906946740729018 | 0.43 | 0.636 | 0.443 |
| 1.910088333382608 | 0.43 | 0.636 | 0.443 |
| 1.913229926036198 | 0.43 | 0.636 | 0.444 |
| 1.916371518689788 | 0.43 | 0.637 | 0.445 |
| 1.919513111343378 | 0.43 | 0.637 | 0.446 |
| 1.922654703996967 | 0.43 | 0.638 | 0.447 |
| 1.925796296650557 | 0.43 | 0.638 | 0.448 |
| 1.928937889304147 | 0.43 | 0.638 | 0.449 |
| 1.932079481957737 | 0.43 | 0.639 | 0.451 |
| 1.935221074611327 | 0.43 | 0.639 | 0.452 |
| 1.938362667264917 | 0.43 | 0.639 | 0.453 |
| 1.941504259918506 | 0.43 | 0.639 | 0.454 |
| 1.944645852572096 | 0.43 | 0.64 | 0.456 |
| 1.947787445225686 | 0.43 | 0.64 | 0.457 |
| 1.950929037879276 | 0.43 | 0.64 | 0.458 |
| 1.954070630532866 | 0.43 | 0.64 | 0.46 |
| 1.957212223186455 | 0.43 | 0.641 | 0.461 |
| 1.960353815840045 | 0.43 | 0.641 | 0.463 |
| 1.963495408493635 | 0.43 | 0.641 | 0.465 |
| 1.966637001147225 | 0.43 | 0.641 | 0.466 |
| 1.969778593800815 | 0.43 | 0.641 | 0.468 |
| 1.972920186454405 | 0.43 | 0.642 | 0.47 |
| 1.976061779107994 | 0.43 | 0.642 | 0.472 |
| 1.979203371761584 | 0.43 | 0.642 | 0.474 |
| 1.982344964415174 | 0.43 | 0.642 | 0.476 |
| 1.985486557068764 | 0.43 | 0.642 | 0.478 |
| 1.988628149722354 | 0.43 | 0.642 | 0.48 |
| 1.991769742375943 | 0.43 | 0.642 | 0.482 |
| 1.994911335029533 | 0.43 | 0.643 | 0.484 |
| 1.998052927683123 | 0.43 | 0.643 | 0.486 |
| 2.001194520336712 | 0.43 | 0.643 | 0.488 |
| 2.004336112990302 | 0.43 | 0.643 | 0.491 |
| 2.007477705643892 | 0.43 | 0.643 | 0.493 |
| 2.010619298297482 | 0.43 | 0.643 | 0.495 |
| 2.013760890951071 | 0.43 | 0.643 | 0.498 |
| 2.016902483604661 | 0.43 | 0.643 | 0.5 |
| 2.02004407625825 | 0.43 | 0.643 | 0.503 |
| 2.02318566891184 | 0.43 | 0.643 | 0.506 |
| 2.02632726156543 | 0.43 | 0.643 | 0.508 |
| 2.029468854219019 | 0.43 | 0.644 | 0.511 |
| 2.032610446872609 | 0.43 | 0.644 | 0.514 |
| 2.035752039526198 | 0.43 | 0.644 | 0.516 |
| 2.038893632179788 | 0.43 | 0.644 | 0.519 |
| 2.042035224833378 | 0.43 | 0.644 | 0.522 |
| 2.045176817486967 | 0.43 | 0.644 | 0.525 |
| 2.048318410140557 | 0.43 | 0.644 | 0.528 |
| 2.051460002794146 | 0.43 | 0.644 | 0.531 |
| 2.054601595447736 | 0.43 | 0.644 | 0.534 |
| 2.057743188101325 | 0.43 | 0.644 | 0.537 |
| 2.060884780754915 | 0.43 | 0.644 | 0.54 |
| 2.064026373408505 | 0.43 | 0.644 | 0.543 |
| 2.067167966062094 | 0.43 | 0.644 | 0.546 |
| 2.070309558715684 | 0.43 | 0.644 | 0.549 |
| 2.073451151369273 | 0.43 | 0.644 | 0.552 |
| 2.076592744022863 | 0.43 | 0.644 | 0.555 |
| 2.079734336676452 | 0.43 | 0.644 | 0.558 |
| 2.082875929330042 | 0.43 | 0.644 | 0.561 |
| 2.086017521983632 | 0.43 | 0.644 | 0.564 |
| 2.089159114637221 | 0.43 | 0.644 | 0.567 |
| 2.092300707290811 | 0.43 | 0.644 | 0.571 |
| 2.095442299944401 | 0.43 | 0.644 | 0.574 |
| 2.09858389259799 | 0.43 | 0.644 | 0.577 |
| 2.10172548525158 | 0.43 | 0.644 | 0.58 |
| 2.104867077905169 | 0.43 | 0.644 | 0.583 |
| 2.108008670558759 | 0.43 | 0.644 | 0.586 |
| 2.111150263212349 | 0.43 | 0.644 | 0.589 |
| 2.114291855865938 | 0.43 | 0.644 | 0.592 |
| 2.117433448519528 | 0.43 | 0.644 | 0.596 |
| 2.120575041173117 | 0.43 | 0.644 | 0.599 |
| 2.123716633826707 | 0.43 | 0.644 | 0.602 |
| 2.126858226480297 | 0.43 | 0.644 | 0.605 |
| 2.129999819133886 | 0.43 | 0.644 | 0.608 |
| 2.133141411787476 | 0.43 | 0.644 | 0.611 |
| 2.136283004441065 | 0.43 | 0.644 | 0.614 |
| 2.139424597094655 | 0.43 | 0.644 | 0.617 |
| 2.142566189748245 | 0.43 | 0.644 | 0.62 |
| 2.145707782401834 | 0.43 | 0.644 | 0.622 |
| 2.148849375055424 | 0.43 | 0.644 | 0.625 |
| 2.151990967709013 | 0.43 | 0.644 | 0.628 |
| 2.155132560362603 | 0.43 | 0.644 | 0.631 |
| 2.158274153016193 | 0.43 | 0.644 | 0.634 |
| 2.161415745669782 | 0.43 | 0.644 | 0.636 |
| 2.164557338323372 | 0.43 | 0.644 | 0.639 |
| 2.167698930976961 | 0.43 | 0.644 | 0.642 |
| 2.170840523630551 | 0.43 | 0.644 | 0.644 |
| 2.173982116284141 | 0.43 | 0.644 | 0.647 |
| 2.17712370893773 | 0.43 | 0.644 | 0.649 |
| 2.18026530159132 | 0.43 | 0.644 | 0.651 |
| 2.183406894244909 | 0.43 | 0.644 | 0.654 |
| 2.186548486898499 | 0.43 | 0.644 | 0.656 |
| 2.189690079552089 | 0.43 | 0.644 | 0.658 |
| 2.192831672205678 | 0.431 | 0.644 | 0.661 |
| 2.195973264859268 | 0.431 | 0.644 | 0.663 |
| 2.199114857512857 | 0.431 | 0.644 | 0.665 |
| 2.202256450166447 | 0.431 | 0.644 | 0.667 |
| 2.205398042820036 | 0.431 | 0.644 | 0.669 |
| 2.208539635473626 | 0.431 | 0.644 | 0.671 |
| 2.211681228127216 | 0.431 | 0.644 | 0.673 |
| 2.214822820780805 | 0.431 | 0.644 | 0.675 |
| 2.217964413434395 | 0.431 | 0.644 | 0.677 |
| 2.221106006087984 | 0.431 | 0.644 | 0.678 |
| 2.224247598741574 | 0.431 | 0.644 | 0.68 |
| 2.227389191395164 | 0.431 | 0.644 | 0.682 |
| 2.230530784048753 | 0.431 | 0.644 | 0.683 |
| 2.233672376702343 | 0.431 | 0.644 | 0.685 |
| 2.236813969355933 | 0.431 | 0.644 | 0.686 |
| 2.239955562009522 | 0.431 | 0.644 | 0.688 |
| 2.243097154663112 | 0.431 | 0.644 | 0.689 |
| 2.246238747316701 | 0.431 | 0.644 | 0.691 |
| 2.249380339970291 | 0.432 | 0.644 | 0.692 |
| 2.252521932623881 | 0.432 | 0.644 | 0.693 |
| 2.25566352527747 | 0.432 | 0.644 | 0.694 |
| 2.25880511793106 | 0.432 | 0.644 | 0.696 |
| 2.261946710584649 | 0.432 | 0.644 | 0.697 |
| 2.265088303238239 | 0.432 | 0.644 | 0.698 |
| 2.268229895891829 | 0.432 | 0.644 | 0.699 |
| 2.271371488545418 | 0.432 | 0.644 | 0.7 |
| 2.274513081199008 | 0.432 | 0.644 | 0.701 |
| 2.277654673852597 | 0.432 | 0.644 | 0.702 |
| 2.280796266506186 | 0.432 | 0.644 | 0.703 |
| 2.283937859159776 | 0.433 | 0.644 | 0.703 |
| 2.287079451813366 | 0.433 | 0.644 | 0.704 |
| 2.290221044466955 | 0.433 | 0.644 | 0.705 |
| 2.293362637120545 | 0.433 | 0.644 | 0.706 |
| 2.296504229774135 | 0.433 | 0.644 | 0.706 |
| 2.299645822427724 | 0.433 | 0.644 | 0.707 |
| 2.302787415081314 | 0.433 | 0.644 | 0.707 |
| 2.305929007734904 | 0.433 | 0.644 | 0.708 |
| 2.309070600388493 | 0.433 | 0.644 | 0.709 |
| 2.312212193042083 | 0.434 | 0.644 | 0.709 |
| 2.315353785695672 | 0.434 | 0.644 | 0.71 |
| 2.318495378349262 | 0.434 | 0.644 | 0.71 |
| 2.321636971002852 | 0.434 | 0.644 | 0.71 |
| 2.324778563656441 | 0.434 | 0.644 | 0.711 |
| 2.327920156310031 | 0.434 | 0.644 | 0.711 |
| 2.33106174896362 | 0.435 | 0.644 | 0.712 |
| 2.33420334161721 | 0.435 | 0.644 | 0.712 |
| 2.3373449342708 | 0.435 | 0.644 | 0.712 |
| 2.340486526924389 | 0.435 | 0.644 | 0.713 |
| 2.343628119577979 | 0.435 | 0.644 | 0.713 |
| 2.346769712231568 | 0.435 | 0.644 | 0.713 |
| 2.349911304885158 | 0.436 | 0.644 | 0.713 |
| 2.353052897538748 | 0.436 | 0.644 | 0.714 |
| 2.356194490192337 | 0.436 | 0.644 | 0.714 |
| 2.359336082845927 | 0.436 | 0.644 | 0.714 |
| 2.362477675499516 | 0.436 | 0.644 | 0.714 |
| 2.365619268153106 | 0.437 | 0.644 | 0.714 |
| 2.368760860806696 | 0.437 | 0.644 | 0.714 |
| 2.371902453460285 | 0.437 | 0.644 | 0.715 |
| 2.375044046113875 | 0.437 | 0.644 | 0.715 |
| 2.378185638767464 | 0.437 | 0.644 | 0.715 |
| 2.381327231421054 | 0.438 | 0.644 | 0.715 |
| 2.384468824074644 | 0.438 | 0.644 | 0.715 |
| 2.387610416728233 | 0.438 | 0.644 | 0.715 |
| 2.390752009381823 | 0.438 | 0.644 | 0.715 |
| 2.393893602035412 | 0.439 | 0.644 | 0.715 |
| 2.397035194689002 | 0.439 | 0.644 | 0.715 |
| 2.400176787342591 | 0.439 | 0.644 | 0.715 |
| 2.403318379996181 | 0.439 | 0.644 | 0.715 |
| 2.406459972649771 | 0.44 | 0.644 | 0.715 |
| 2.40960156530336 | 0.44 | 0.644 | 0.716 |
| 2.41274315795695 | 0.44 | 0.644 | 0.716 |
| 2.41588475061054 | 0.441 | 0.644 | 0.716 |
| 2.419026343264129 | 0.441 | 0.644 | 0.716 |
| 2.422167935917719 | 0.441 | 0.644 | 0.716 |
| 2.425309528571308 | 0.442 | 0.644 | 0.716 |
| 2.428451121224898 | 0.442 | 0.644 | 0.716 |
| 2.431592713878488 | 0.442 | 0.644 | 0.716 |
| 2.434734306532077 | 0.443 | 0.644 | 0.716 |
| 2.437875899185667 | 0.443 | 0.644 | 0.716 |
| 2.441017491839256 | 0.443 | 0.644 | 0.716 |
| 2.444159084492846 | 0.444 | 0.644 | 0.716 |
| 2.447300677146435 | 0.444 | 0.644 | 0.716 |
| 2.450442269800025 | 0.444 | 0.644 | 0.716 |
| 2.453583862453615 | 0.445 | 0.644 | 0.716 |
| 2.456725455107204 | 0.445 | 0.644 | 0.716 |
| 2.459867047760794 | 0.446 | 0.644 | 0.716 |
| 2.463008640414384 | 0.446 | 0.644 | 0.716 |
| 2.466150233067973 | 0.447 | 0.644 | 0.716 |
| 2.469291825721563 | 0.447 | 0.644 | 0.716 |
| 2.472433418375152 | 0.447 | 0.644 | 0.716 |
| 2.475575011028742 | 0.448 | 0.644 | 0.716 |
| 2.478716603682332 | 0.448 | 0.644 | 0.716 |
| 2.481858196335921 | 0.449 | 0.644 | 0.716 |
| 2.48499978898951 | 0.449 | 0.644 | 0.716 |
| 2.4881413816431 | 0.45 | 0.644 | 0.716 |
| 2.49128297429669 | 0.45 | 0.644 | 0.716 |
| 2.49442456695028 | 0.451 | 0.644 | 0.716 |
| 2.497566159603869 | 0.451 | 0.644 | 0.716 |
| 2.500707752257458 | 0.452 | 0.644 | 0.716 |
| 2.503849344911048 | 0.452 | 0.644 | 0.716 |
| 2.506990937564638 | 0.453 | 0.644 | 0.716 |
| 2.510132530218228 | 0.454 | 0.644 | 0.716 |
| 2.513274122871817 | 0.454 | 0.644 | 0.716 |
| 2.516415715525407 | 0.455 | 0.644 | 0.716 |
| 2.519557308178996 | 0.455 | 0.644 | 0.716 |
| 2.522698900832586 | 0.456 | 0.644 | 0.716 |
| 2.525840493486176 | 0.456 | 0.644 | 0.716 |
| 2.528982086139765 | 0.457 | 0.644 | 0.716 |
| 2.532123678793355 | 0.458 | 0.644 | 0.716 |
| 2.535265271446944 | 0.458 | 0.644 | 0.716 |
| 2.538406864100534 | 0.459 | 0.644 | 0.716 |
| 2.541548456754124 | 0.46 | 0.644 | 0.716 |
| 2.544690049407713 | 0.46 | 0.644 | 0.716 |
| 2.547831642061302 | 0.461 | 0.644 | 0.716 |
| 2.550973234714892 | 0.462 | 0.644 | 0.716 |
| 2.554114827368482 | 0.463 | 0.644 | 0.716 |
| 2.557256420022072 | 0.463 | 0.644 | 0.716 |
| 2.560398012675661 | 0.464 | 0.644 | 0.716 |
| 2.563539605329251 | 0.465 | 0.644 | 0.716 |
| 2.56668119798284 | 0.466 | 0.644 | 0.716 |
| 2.56982279063643 | 0.466 | 0.644 | 0.716 |
| 2.57296438329002 | 0.467 | 0.644 | 0.716 |
| 2.576105975943609 | 0.468 | 0.644 | 0.716 |
| 2.579247568597199 | 0.469 | 0.644 | 0.716 |
| 2.582389161250788 | 0.47 | 0.644 | 0.716 |
| 2.585530753904377 | 0.47 | 0.644 | 0.716 |
| 2.588672346557967 | 0.471 | 0.644 | 0.716 |
| 2.591813939211557 | 0.472 | 0.644 | 0.716 |
| 2.594955531865147 | 0.473 | 0.644 | 0.716 |
| 2.598097124518736 | 0.474 | 0.644 | 0.716 |
| 2.601238717172326 | 0.475 | 0.644 | 0.716 |
| 2.604380309825915 | 0.476 | 0.644 | 0.716 |
| 2.607521902479505 | 0.477 | 0.644 | 0.716 |
| 2.610663495133095 | 0.478 | 0.644 | 0.716 |
| 2.613805087786684 | 0.479 | 0.644 | 0.716 |
| 2.616946680440274 | 0.48 | 0.644 | 0.716 |
| 2.620088273093863 | 0.481 | 0.644 | 0.716 |
| 2.623229865747452 | 0.482 | 0.644 | 0.716 |
| 2.626371458401042 | 0.483 | 0.644 | 0.716 |
| 2.629513051054632 | 0.484 | 0.644 | 0.716 |
| 2.632654643708222 | 0.485 | 0.644 | 0.716 |
| 2.635796236361811 | 0.486 | 0.644 | 0.716 |
| 2.638937829015401 | 0.487 | 0.645 | 0.716 |
| 2.642079421668991 | 0.488 | 0.645 | 0.716 |
| 2.64522101432258 | 0.489 | 0.645 | 0.716 |
| 2.64836260697617 | 0.49 | 0.645 | 0.716 |
| 2.651504199629759 | 0.491 | 0.645 | 0.716 |
| 2.654645792283349 | 0.493 | 0.645 | 0.716 |
| 2.657787384936938 | 0.494 | 0.645 | 0.716 |
| 2.660928977590528 | 0.495 | 0.645 | 0.716 |
| 2.664070570244118 | 0.496 | 0.645 | 0.716 |
| 2.667212162897707 | 0.497 | 0.645 | 0.716 |
| 2.670353755551297 | 0.499 | 0.645 | 0.716 |
| 2.673495348204887 | 0.5 | 0.645 | 0.716 |
| 2.676636940858476 | 0.501 | 0.645 | 0.716 |
| 2.679778533512066 | 0.502 | 0.645 | 0.716 |
| 2.682920126165655 | 0.504 | 0.645 | 0.716 |
| 2.686061718819245 | 0.505 | 0.645 | 0.716 |
| 2.689203311472835 | 0.506 | 0.645 | 0.716 |
| 2.692344904126424 | 0.508 | 0.645 | 0.716 |
| 2.695486496780014 | 0.509 | 0.645 | 0.716 |
| 2.698628089433603 | 0.51 | 0.645 | 0.716 |
| 2.701769682087193 | 0.512 | 0.645 | 0.716 |
| 2.704911274740782 | 0.513 | 0.646 | 0.716 |
| 2.708052867394372 | 0.515 | 0.646 | 0.716 |
| 2.711194460047962 | 0.516 | 0.646 | 0.716 |
| 2.714336052701551 | 0.518 | 0.646 | 0.716 |
| 2.717477645355141 | 0.519 | 0.646 | 0.716 |
| 2.720619238008731 | 0.521 | 0.646 | 0.716 |
| 2.72376083066232 | 0.522 | 0.646 | 0.716 |
| 2.72690242331591 | 0.524 | 0.646 | 0.716 |
| 2.730044015969499 | 0.525 | 0.646 | 0.716 |
| 2.733185608623089 | 0.527 | 0.647 | 0.716 |
| 2.736327201276678 | 0.528 | 0.647 | 0.716 |
| 2.739468793930268 | 0.53 | 0.647 | 0.716 |
| 2.742610386583858 | 0.532 | 0.647 | 0.716 |
| 2.745751979237447 | 0.533 | 0.647 | 0.716 |
| 2.748893571891036 | 0.535 | 0.647 | 0.716 |
| 2.752035164544627 | 0.537 | 0.648 | 0.716 |
| 2.755176757198216 | 0.538 | 0.648 | 0.716 |
| 2.758318349851806 | 0.54 | 0.648 | 0.716 |
| 2.761459942505395 | 0.542 | 0.648 | 0.716 |
| 2.764601535158985 | 0.543 | 0.649 | 0.716 |
| 2.767743127812574 | 0.545 | 0.649 | 0.716 |
| 2.770884720466164 | 0.547 | 0.649 | 0.716 |
| 2.774026313119754 | 0.549 | 0.649 | 0.716 |
| 2.777167905773343 | 0.551 | 0.65 | 0.716 |
| 2.780309498426932 | 0.552 | 0.65 | 0.716 |
| 2.783451091080522 | 0.554 | 0.65 | 0.716 |
| 2.786592683734112 | 0.556 | 0.651 | 0.716 |
| 2.789734276387701 | 0.558 | 0.651 | 0.716 |
| 2.792875869041291 | 0.56 | 0.651 | 0.716 |
| 2.796017461694881 | 0.562 | 0.652 | 0.716 |
| 2.79915905434847 | 0.564 | 0.652 | 0.716 |
| 2.80230064700206 | 0.566 | 0.653 | 0.716 |
| 2.80544223965565 | 0.568 | 0.653 | 0.716 |
| 2.808583832309239 | 0.57 | 0.653 | 0.716 |
| 2.811725424962829 | 0.572 | 0.654 | 0.716 |
| 2.814867017616419 | 0.574 | 0.654 | 0.716 |
| 2.818008610270008 | 0.576 | 0.655 | 0.716 |
| 2.821150202923598 | 0.578 | 0.655 | 0.716 |
| 2.824291795577187 | 0.58 | 0.656 | 0.716 |
| 2.827433388230777 | 0.582 | 0.657 | 0.716 |
| 2.830574980884366 | 0.584 | 0.657 | 0.716 |
| 2.833716573537956 | 0.586 | 0.658 | 0.716 |
| 2.836858166191546 | 0.588 | 0.658 | 0.716 |
| 2.839999758845135 | 0.591 | 0.659 | 0.716 |
| 2.843141351498725 | 0.593 | 0.66 | 0.717 |
| 2.846282944152314 | 0.595 | 0.66 | 0.717 |
| 2.849424536805904 | 0.597 | 0.661 | 0.717 |
| 2.852566129459494 | 0.599 | 0.662 | 0.717 |
| 2.855707722113083 | 0.602 | 0.663 | 0.717 |
| 2.858849314766673 | 0.604 | 0.663 | 0.717 |
| 2.861990907420262 | 0.606 | 0.664 | 0.717 |
| 2.865132500073852 | 0.609 | 0.665 | 0.717 |
| 2.868274092727442 | 0.611 | 0.666 | 0.717 |
| 2.871415685381031 | 0.613 | 0.667 | 0.718 |
| 2.874557278034621 | 0.615 | 0.668 | 0.718 |
| 2.87769887068821 | 0.618 | 0.669 | 0.718 |
| 2.8808404633418 | 0.62 | 0.67 | 0.718 |
| 2.88398205599539 | 0.623 | 0.671 | 0.718 |
| 2.88712364864898 | 0.625 | 0.672 | 0.718 |
| 2.890265241302569 | 0.627 | 0.673 | 0.719 |
| 2.893406833956158 | 0.63 | 0.674 | 0.719 |
| 2.896548426609748 | 0.632 | 0.675 | 0.719 |
| 2.899690019263338 | 0.635 | 0.676 | 0.72 |
| 2.902831611916927 | 0.637 | 0.678 | 0.72 |
| 2.905973204570517 | 0.64 | 0.679 | 0.72 |
| 2.909114797224106 | 0.642 | 0.68 | 0.721 |
| 2.912256389877696 | 0.645 | 0.681 | 0.721 |
| 2.915397982531286 | 0.647 | 0.683 | 0.721 |
| 2.918539575184875 | 0.65 | 0.684 | 0.722 |
| 2.921681167838465 | 0.653 | 0.685 | 0.722 |
| 2.924822760492054 | 0.655 | 0.687 | 0.723 |
| 2.927964353145644 | 0.658 | 0.688 | 0.723 |
| 2.931105945799234 | 0.66 | 0.69 | 0.724 |
| 2.934247538452823 | 0.663 | 0.691 | 0.724 |
| 2.937389131106413 | 0.666 | 0.693 | 0.725 |
| 2.940530723760002 | 0.668 | 0.695 | 0.726 |
| 2.943672316413592 | 0.671 | 0.696 | 0.726 |
| 2.946813909067182 | 0.674 | 0.698 | 0.727 |
| 2.949955501720771 | 0.676 | 0.7 | 0.728 |
| 2.953097094374361 | 0.679 | 0.701 | 0.729 |
| 2.95623868702795 | 0.682 | 0.703 | 0.729 |
| 2.95938027968154 | 0.685 | 0.705 | 0.73 |
| 2.96252187233513 | 0.687 | 0.707 | 0.731 |
| 2.965663464988719 | 0.69 | 0.709 | 0.732 |
| 2.968805057642309 | 0.693 | 0.71 | 0.733 |
| 2.971946650295898 | 0.696 | 0.712 | 0.734 |
| 2.975088242949488 | 0.698 | 0.714 | 0.735 |
| 2.978229835603078 | 0.701 | 0.716 | 0.736 |
| 2.981371428256667 | 0.704 | 0.718 | 0.738 |
| 2.984513020910257 | 0.707 | 0.721 | 0.739 |
| 2.987654613563846 | 0.71 | 0.723 | 0.74 |
| 2.990796206217436 | 0.713 | 0.725 | 0.741 |
| 2.993937798871025 | 0.716 | 0.727 | 0.743 |
| 2.997079391524615 | 0.718 | 0.729 | 0.744 |
| 3.000220984178205 | 0.721 | 0.731 | 0.746 |
| 3.003362576831794 | 0.724 | 0.734 | 0.747 |
| 3.006504169485384 | 0.727 | 0.736 | 0.749 |
| 3.009645762138974 | 0.73 | 0.738 | 0.75 |
| 3.012787354792563 | 0.733 | 0.741 | 0.752 |
| 3.015928947446153 | 0.736 | 0.743 | 0.754 |
| 3.019070540099742 | 0.739 | 0.746 | 0.756 |
| 3.022212132753332 | 0.742 | 0.748 | 0.757 |
| 3.025353725406922 | 0.745 | 0.751 | 0.759 |
| 3.028495318060511 | 0.748 | 0.753 | 0.761 |
| 3.031636910714101 | 0.751 | 0.756 | 0.763 |
| 3.03477850336769 | 0.754 | 0.758 | 0.765 |
| 3.03792009602128 | 0.757 | 0.761 | 0.767 |
| 3.04106168867487 | 0.76 | 0.764 | 0.77 |
| 3.04420328132846 | 0.763 | 0.766 | 0.772 |
| 3.047344873982049 | 0.766 | 0.769 | 0.774 |
| 3.050486466635638 | 0.769 | 0.772 | 0.776 |
| 3.053628059289228 | 0.772 | 0.775 | 0.779 |
| 3.056769651942818 | 0.775 | 0.777 | 0.781 |
| 3.059911244596407 | 0.778 | 0.78 | 0.783 |
| 3.063052837249997 | 0.781 | 0.783 | 0.786 |
| 3.066194429903586 | 0.784 | 0.786 | 0.788 |
| 3.069336022557176 | 0.787 | 0.789 | 0.791 |
| 3.072477615210766 | 0.79 | 0.792 | 0.794 |
| 3.075619207864355 | 0.793 | 0.795 | 0.796 |
| 3.078760800517945 | 0.797 | 0.797 | 0.799 |
| 3.081902393171534 | 0.8 | 0.8 | 0.802 |
| 3.085043985825124 | 0.803 | 0.803 | 0.805 |
| 3.088185578478713 | 0.806 | 0.806 | 0.807 |
| 3.091327171132303 | 0.809 | 0.809 | 0.81 |
| 3.094468763785893 | 0.812 | 0.812 | 0.813 |
| 3.097610356439482 | 0.815 | 0.815 | 0.816 |
| 3.100751949093072 | 0.818 | 0.819 | 0.819 |
| 3.103893541746661 | 0.821 | 0.822 | 0.822 |
| 3.107035134400251 | 0.825 | 0.825 | 0.825 |
| 3.110176727053841 | 0.828 | 0.828 | 0.828 |
| 3.11331831970743 | 0.831 | 0.831 | 0.831 |
| 3.11645991236102 | 0.834 | 0.834 | 0.834 |
| 3.11960150501461 | 0.837 | 0.837 | 0.837 |
| 3.122743097668199 | 0.84 | 0.84 | 0.84 |
| 3.125884690321789 | 0.843 | 0.843 | 0.843 |
| 3.129026282975378 | 0.846 | 0.846 | 0.846 |
| 3.132167875628968 | 0.85 | 0.85 | 0.85 |
| 3.135309468282557 | 0.853 | 0.853 | 0.853 |
| 3.138451060936147 | 0.856 | 0.856 | 0.856 |
| 3.141592653589737 | 0.859 | 0.859 | 0.859 |
| 3.144734246243326 | 0.862 | 0.862 | 0.862 |
| 3.147875838896916 | 0.865 | 0.865 | 0.865 |
| 3.151017431550505 | 0.868 | 0.868 | 0.868 |
| 3.154159024204095 | 0.872 | 0.872 | 0.872 |
| 3.157300616857685 | 0.875 | 0.875 | 0.875 |
| 3.160442209511274 | 0.878 | 0.878 | 0.878 |
| 3.163583802164864 | 0.881 | 0.881 | 0.881 |
| 3.166725394818453 | 0.884 | 0.884 | 0.884 |
| 3.169866987472043 | 0.887 | 0.887 | 0.887 |
| 3.173008580125633 | 0.89 | 0.89 | 0.89 |
| 3.176150172779222 | 0.894 | 0.893 | 0.893 |
| 3.179291765432812 | 0.897 | 0.896 | 0.896 |
| 3.182433358086401 | 0.9 | 0.9 | 0.899 |
| 3.185574950739991 | 0.903 | 0.903 | 0.902 |
| 3.188716543393581 | 0.906 | 0.906 | 0.905 |
| 3.19185813604717 | 0.909 | 0.909 | 0.908 |
| 3.19499972870076 | 0.912 | 0.912 | 0.911 |
| 3.198141321354349 | 0.915 | 0.915 | 0.913 |
| 3.20128291400794 | 0.918 | 0.918 | 0.916 |
| 3.204424506661528 | 0.922 | 0.921 | 0.919 |
| 3.207566099315118 | 0.925 | 0.924 | 0.922 |
| 3.210707691968708 | 0.928 | 0.926 | 0.924 |
| 3.213849284622297 | 0.931 | 0.929 | 0.927 |
| 3.216990877275887 | 0.934 | 0.932 | 0.93 |
| 3.220132469929476 | 0.937 | 0.935 | 0.932 |
| 3.223274062583066 | 0.94 | 0.938 | 0.935 |
| 3.226415655236656 | 0.943 | 0.941 | 0.937 |
| 3.229557247890245 | 0.946 | 0.943 | 0.939 |
| 3.232698840543835 | 0.949 | 0.946 | 0.942 |
| 3.235840433197425 | 0.952 | 0.949 | 0.944 |
| 3.238982025851014 | 0.955 | 0.952 | 0.946 |
| 3.242123618504604 | 0.958 | 0.954 | 0.949 |
| 3.245265211158193 | 0.961 | 0.957 | 0.951 |
| 3.248406803811783 | 0.964 | 0.96 | 0.953 |
| 3.251548396465373 | 0.967 | 0.962 | 0.955 |
| 3.254689989118962 | 0.97 | 0.965 | 0.957 |
| 3.257831581772551 | 0.973 | 0.967 | 0.959 |
| 3.260973174426141 | 0.976 | 0.97 | 0.961 |
| 3.26411476707973 | 0.979 | 0.972 | 0.962 |
| 3.267256359733321 | 0.982 | 0.975 | 0.964 |
| 3.27039795238691 | 0.985 | 0.977 | 0.966 |
| 3.2735395450405 | 0.988 | 0.98 | 0.968 |
| 3.276681137694089 | 0.991 | 0.982 | 0.969 |
| 3.279822730347679 | 0.994 | 0.984 | 0.971 |
| 3.282964323001269 | 0.997 | 0.987 | 0.972 |
| 3.286105915654858 | 1 | 0.989 | 0.974 |
| 3.289247508308448 | 1.002 | 0.991 | 0.975 |
| 3.292389100962037 | 1.005 | 0.993 | 0.977 |
| 3.295530693615627 | 1.008 | 0.995 | 0.978 |
| 3.298672286269217 | 1.011 | 0.998 | 0.979 |
| 3.301813878922806 | 1.014 | 1 | 0.98 |
| 3.304955471576396 | 1.017 | 1.002 | 0.982 |
| 3.308097064229985 | 1.02 | 1.004 | 0.983 |
| 3.311238656883575 | 1.022 | 1.006 | 0.984 |
| 3.314380249537165 | 1.025 | 1.008 | 0.985 |
| 3.317521842190754 | 1.028 | 1.01 | 0.986 |
| 3.320663434844344 | 1.031 | 1.011 | 0.987 |
| 3.323805027497933 | 1.033 | 1.013 | 0.988 |
| 3.326946620151523 | 1.036 | 1.015 | 0.989 |
| 3.330088212805113 | 1.039 | 1.017 | 0.989 |
| 3.333229805458702 | 1.042 | 1.019 | 0.99 |
| 3.336371398112292 | 1.044 | 1.02 | 0.991 |
| 3.339512990765881 | 1.047 | 1.022 | 0.992 |
| 3.342654583419471 | 1.05 | 1.024 | 0.992 |
| 3.345796176073061 | 1.052 | 1.025 | 0.993 |
| 3.34893776872665 | 1.055 | 1.027 | 0.994 |
| 3.35207936138024 | 1.058 | 1.028 | 0.994 |
| 3.355220954033829 | 1.06 | 1.03 | 0.995 |
| 3.358362546687419 | 1.063 | 1.031 | 0.995 |
| 3.361504139341009 | 1.065 | 1.033 | 0.996 |
| 3.364645731994598 | 1.068 | 1.034 | 0.996 |
| 3.367787324648188 | 1.071 | 1.035 | 0.997 |
| 3.370928917301777 | 1.073 | 1.037 | 0.997 |
| 3.374070509955367 | 1.076 | 1.038 | 0.997 |
| 3.377212102608956 | 1.078 | 1.039 | 0.998 |
| 3.380353695262546 | 1.081 | 1.041 | 0.998 |
| 3.383495287916136 | 1.083 | 1.042 | 0.998 |
| 3.386636880569725 | 1.086 | 1.043 | 0.999 |
| 3.389778473223315 | 1.088 | 1.044 | 0.999 |
| 3.392920065876904 | 1.091 | 1.045 | 0.999 |
| 3.396061658530494 | 1.093 | 1.046 | 1 |
| 3.399203251184084 | 1.095 | 1.047 | 1 |
| 3.402344843837673 | 1.098 | 1.048 | 1 |
| 3.405486436491263 | 1.1 | 1.049 | 1 |
| 3.408628029144852 | 1.103 | 1.05 | 1 |
| 3.411769621798442 | 1.105 | 1.051 | 1.001 |
| 3.414911214452032 | 1.107 | 1.052 | 1.001 |
| 3.418052807105621 | 1.11 | 1.053 | 1.001 |
| 3.421194399759211 | 1.112 | 1.054 | 1.001 |
| 3.4243359924128 | 1.114 | 1.055 | 1.001 |
| 3.42747758506639 | 1.116 | 1.055 | 1.001 |
| 3.43061917771998 | 1.119 | 1.056 | 1.001 |
| 3.433760770373569 | 1.121 | 1.057 | 1.001 |
| 3.436902363027159 | 1.123 | 1.058 | 1.001 |
| 3.440043955680748 | 1.125 | 1.058 | 1.002 |
| 3.443185548334338 | 1.127 | 1.059 | 1.002 |
| 3.446327140987927 | 1.13 | 1.06 | 1.002 |
| 3.449468733641517 | 1.132 | 1.06 | 1.002 |
| 3.452610326295107 | 1.134 | 1.061 | 1.002 |
| 3.455751918948696 | 1.136 | 1.062 | 1.002 |
| 3.458893511602286 | 1.138 | 1.062 | 1.002 |
| 3.462035104255876 | 1.14 | 1.063 | 1.002 |
| 3.465176696909465 | 1.142 | 1.063 | 1.002 |
| 3.468318289563055 | 1.144 | 1.064 | 1.002 |
| 3.471459882216644 | 1.146 | 1.064 | 1.002 |
| 3.474601474870234 | 1.148 | 1.065 | 1.002 |
| 3.477743067523824 | 1.15 | 1.065 | 1.002 |
| 3.480884660177413 | 1.152 | 1.065 | 1.002 |
| 3.484026252831002 | 1.154 | 1.066 | 1.002 |
| 3.487167845484592 | 1.156 | 1.066 | 1.002 |
| 3.490309438138182 | 1.158 | 1.067 | 1.002 |
| 3.493451030791772 | 1.16 | 1.067 | 1.002 |
| 3.496592623445361 | 1.162 | 1.067 | 1.002 |
| 3.499734216098951 | 1.164 | 1.068 | 1.002 |
| 3.50287580875254 | 1.166 | 1.068 | 1.002 |
| 3.50601740140613 | 1.167 | 1.068 | 1.002 |
| 3.50915899405972 | 1.169 | 1.069 | 1.002 |
| 3.512300586713309 | 1.171 | 1.069 | 1.002 |
| 3.515442179366899 | 1.173 | 1.069 | 1.002 |
| 3.518583772020488 | 1.175 | 1.069 | 1.002 |
| 3.521725364674078 | 1.176 | 1.07 | 1.002 |
| 3.524866957327668 | 1.178 | 1.07 | 1.002 |
| 3.528008549981257 | 1.18 | 1.07 | 1.002 |
| 3.531150142634847 | 1.181 | 1.07 | 1.002 |
| 3.534291735288436 | 1.183 | 1.071 | 1.002 |
| 3.537433327942026 | 1.185 | 1.071 | 1.002 |
| 3.540574920595616 | 1.186 | 1.071 | 1.002 |
| 3.543716513249205 | 1.188 | 1.071 | 1.002 |
| 3.546858105902795 | 1.19 | 1.071 | 1.002 |
| 3.549999698556384 | 1.191 | 1.071 | 1.002 |
| 3.553141291209974 | 1.193 | 1.072 | 1.002 |
| 3.556282883863564 | 1.194 | 1.072 | 1.002 |
| 3.559424476517153 | 1.196 | 1.072 | 1.002 |
| 3.562566069170743 | 1.197 | 1.072 | 1.002 |
| 3.565707661824332 | 1.199 | 1.072 | 1.002 |
| 3.568849254477922 | 1.2 | 1.072 | 1.002 |
| 3.571990847131511 | 1.202 | 1.072 | 1.002 |
| 3.575132439785101 | 1.203 | 1.072 | 1.002 |
| 3.578274032438691 | 1.205 | 1.073 | 1.002 |
| 3.58141562509228 | 1.206 | 1.073 | 1.002 |
| 3.58455721774587 | 1.208 | 1.073 | 1.002 |
| 3.58769881039946 | 1.209 | 1.073 | 1.002 |
| 3.590840403053049 | 1.21 | 1.073 | 1.002 |
| 3.593981995706639 | 1.212 | 1.073 | 1.002 |
| 3.597123588360228 | 1.213 | 1.073 | 1.002 |
| 3.600265181013818 | 1.214 | 1.073 | 1.002 |
| 3.603406773667407 | 1.216 | 1.073 | 1.002 |
| 3.606548366320997 | 1.217 | 1.073 | 1.002 |
| 3.609689958974587 | 1.218 | 1.073 | 1.002 |
| 3.612831551628176 | 1.22 | 1.073 | 1.002 |
| 3.615973144281766 | 1.221 | 1.073 | 1.002 |
| 3.619114736935355 | 1.222 | 1.073 | 1.002 |
| 3.622256329588945 | 1.223 | 1.073 | 1.002 |
| 3.625397922242534 | 1.224 | 1.073 | 1.002 |
| 3.628539514896124 | 1.226 | 1.073 | 1.002 |
| 3.631681107549714 | 1.227 | 1.073 | 1.002 |
| 3.634822700203303 | 1.228 | 1.073 | 1.002 |
| 3.637964292856893 | 1.229 | 1.074 | 1.002 |
| 3.641105885510483 | 1.23 | 1.074 | 1.002 |
| 3.644247478164072 | 1.231 | 1.074 | 1.002 |
| 3.647389070817662 | 1.232 | 1.074 | 1.002 |
| 3.650530663471251 | 1.233 | 1.074 | 1.002 |
| 3.653672256124841 | 1.234 | 1.074 | 1.002 |
| 3.656813848778431 | 1.235 | 1.074 | 1.002 |
| 3.65995544143202 | 1.236 | 1.074 | 1.002 |
| 3.66309703408561 | 1.237 | 1.074 | 1.002 |
| 3.666238626739199 | 1.238 | 1.074 | 1.002 |
| 3.66938021939279 | 1.239 | 1.074 | 1.002 |
| 3.672521812046378 | 1.24 | 1.074 | 1.002 |
| 3.675663404699968 | 1.241 | 1.074 | 1.002 |
| 3.678804997353558 | 1.242 | 1.074 | 1.002 |
| 3.681946590007147 | 1.243 | 1.074 | 1.002 |
| 3.685088182660737 | 1.244 | 1.074 | 1.002 |
| 3.688229775314326 | 1.245 | 1.074 | 1.002 |
| 3.691371367967916 | 1.246 | 1.074 | 1.002 |
| 3.694512960621506 | 1.247 | 1.074 | 1.002 |
| 3.697654553275095 | 1.248 | 1.074 | 1.002 |
| 3.700796145928685 | 1.249 | 1.074 | 1.002 |
| 3.703937738582274 | 1.249 | 1.074 | 1.002 |
| 3.707079331235864 | 1.25 | 1.074 | 1.002 |
| 3.710220923889454 | 1.251 | 1.074 | 1.002 |
| 3.713362516543043 | 1.252 | 1.074 | 1.002 |
| 3.716504109196633 | 1.253 | 1.074 | 1.002 |
| 3.719645701850223 | 1.253 | 1.074 | 1.002 |
| 3.722787294503812 | 1.254 | 1.074 | 1.002 |
| 3.725928887157402 | 1.255 | 1.074 | 1.002 |
| 3.729070479810991 | 1.256 | 1.074 | 1.002 |
| 3.732212072464581 | 1.256 | 1.074 | 1.002 |
| 3.735353665118171 | 1.257 | 1.074 | 1.002 |
| 3.73849525777176 | 1.258 | 1.074 | 1.002 |
| 3.74163685042535 | 1.258 | 1.074 | 1.002 |
| 3.744778443078939 | 1.259 | 1.074 | 1.002 |
| 3.747920035732529 | 1.26 | 1.074 | 1.002 |
| 3.751061628386119 | 1.26 | 1.074 | 1.002 |
| 3.754203221039708 | 1.261 | 1.074 | 1.002 |
| 3.757344813693298 | 1.262 | 1.074 | 1.002 |
| 3.760486406346887 | 1.262 | 1.074 | 1.002 |
| 3.763627999000477 | 1.263 | 1.074 | 1.002 |
| 3.766769591654067 | 1.263 | 1.074 | 1.002 |
| 3.769911184307656 | 1.264 | 1.074 | 1.002 |
| 3.773052776961246 | 1.265 | 1.074 | 1.002 |
| 3.776194369614835 | 1.265 | 1.074 | 1.002 |
| 3.779335962268425 | 1.266 | 1.074 | 1.002 |
| 3.782477554922014 | 1.266 | 1.074 | 1.002 |
| 3.785619147575604 | 1.267 | 1.074 | 1.002 |
| 3.788760740229193 | 1.267 | 1.074 | 1.002 |
| 3.791902332882783 | 1.268 | 1.074 | 1.002 |
| 3.795043925536373 | 1.268 | 1.074 | 1.002 |
| 3.798185518189962 | 1.269 | 1.074 | 1.002 |
| 3.801327110843552 | 1.269 | 1.074 | 1.002 |
| 3.804468703497142 | 1.27 | 1.074 | 1.002 |
| 3.807610296150731 | 1.27 | 1.074 | 1.002 |
| 3.810751888804321 | 1.271 | 1.074 | 1.002 |
| 3.813893481457911 | 1.271 | 1.074 | 1.002 |
| 3.8170350741115 | 1.272 | 1.074 | 1.002 |
| 3.82017666676509 | 1.272 | 1.074 | 1.002 |
| 3.823318259418679 | 1.272 | 1.074 | 1.002 |
| 3.826459852072269 | 1.273 | 1.074 | 1.002 |
| 3.829601444725859 | 1.273 | 1.074 | 1.002 |
| 3.832743037379448 | 1.274 | 1.074 | 1.002 |
| 3.835884630033038 | 1.274 | 1.074 | 1.002 |
| 3.839026222686627 | 1.274 | 1.074 | 1.002 |
| 3.842167815340217 | 1.275 | 1.074 | 1.002 |
| 3.845309407993807 | 1.275 | 1.074 | 1.002 |
| 3.848451000647396 | 1.275 | 1.074 | 1.002 |
| 3.851592593300986 | 1.276 | 1.074 | 1.002 |
| 3.854734185954575 | 1.276 | 1.074 | 1.002 |
| 3.857875778608165 | 1.276 | 1.074 | 1.002 |
| 3.861017371261755 | 1.277 | 1.074 | 1.002 |
| 3.864158963915344 | 1.277 | 1.074 | 1.002 |
| 3.867300556568933 | 1.277 | 1.074 | 1.002 |
| 3.870442149222523 | 1.278 | 1.074 | 1.003 |
| 3.873583741876112 | 1.278 | 1.074 | 1.003 |
| 3.876725334529703 | 1.278 | 1.074 | 1.003 |
| 3.879866927183292 | 1.279 | 1.074 | 1.003 |
| 3.883008519836882 | 1.279 | 1.074 | 1.003 |
| 3.886150112490471 | 1.279 | 1.074 | 1.003 |
| 3.889291705144061 | 1.279 | 1.074 | 1.003 |
| 3.892433297797651 | 1.28 | 1.074 | 1.003 |
| 3.89557489045124 | 1.28 | 1.074 | 1.003 |
| 3.89871648310483 | 1.28 | 1.074 | 1.003 |
| 3.901858075758419 | 1.28 | 1.074 | 1.003 |
| 3.904999668412009 | 1.281 | 1.074 | 1.003 |
| 3.908141261065598 | 1.281 | 1.074 | 1.003 |
| 3.911282853719188 | 1.281 | 1.074 | 1.004 |
| 3.914424446372778 | 1.281 | 1.074 | 1.004 |
| 3.917566039026367 | 1.282 | 1.074 | 1.004 |
| 3.920707631679957 | 1.282 | 1.074 | 1.004 |
| 3.923849224333547 | 1.282 | 1.074 | 1.004 |
| 3.926990816987136 | 1.282 | 1.074 | 1.004 |
| 3.930132409640726 | 1.282 | 1.074 | 1.005 |
| 3.933274002294315 | 1.283 | 1.074 | 1.005 |
| 3.936415594947905 | 1.283 | 1.074 | 1.005 |
| 3.939557187601495 | 1.283 | 1.074 | 1.005 |
| 3.942698780255084 | 1.283 | 1.074 | 1.006 |
| 3.945840372908674 | 1.283 | 1.074 | 1.006 |
| 3.948981965562263 | 1.283 | 1.074 | 1.006 |
| 3.952123558215853 | 1.284 | 1.074 | 1.006 |
| 3.955265150869442 | 1.284 | 1.074 | 1.007 |
| 3.958406743523032 | 1.284 | 1.074 | 1.007 |
| 3.961548336176622 | 1.284 | 1.074 | 1.008 |
| 3.964689928830211 | 1.284 | 1.074 | 1.008 |
| 3.967831521483801 | 1.284 | 1.074 | 1.008 |
| 3.97097311413739 | 1.284 | 1.074 | 1.009 |
| 3.97411470679098 | 1.285 | 1.074 | 1.009 |
| 3.97725629944457 | 1.285 | 1.074 | 1.01 |
| 3.98039789209816 | 1.285 | 1.074 | 1.011 |
| 3.983539484751749 | 1.285 | 1.074 | 1.011 |
| 3.986681077405338 | 1.285 | 1.074 | 1.012 |
| 3.989822670058928 | 1.285 | 1.074 | 1.012 |
| 3.992964262712517 | 1.285 | 1.074 | 1.013 |
| 3.996105855366107 | 1.285 | 1.074 | 1.014 |
| 3.999247448019697 | 1.286 | 1.074 | 1.015 |
| 4.002389040673287 | 1.286 | 1.074 | 1.016 |
| 4.005530633326877 | 1.286 | 1.074 | 1.016 |
| 4.008672225980466 | 1.286 | 1.074 | 1.017 |
| 4.011813818634056 | 1.286 | 1.074 | 1.018 |
| 4.014955411287645 | 1.286 | 1.074 | 1.019 |
| 4.018097003941234 | 1.286 | 1.074 | 1.02 |
| 4.021238596594824 | 1.286 | 1.074 | 1.021 |
| 4.024380189248414 | 1.286 | 1.074 | 1.022 |
| 4.027521781902004 | 1.286 | 1.074 | 1.024 |
| 4.030663374555593 | 1.286 | 1.074 | 1.025 |
| 4.033804967209183 | 1.286 | 1.074 | 1.026 |
| 4.036946559862773 | 1.287 | 1.074 | 1.027 |
| 4.040088152516362 | 1.287 | 1.074 | 1.029 |
| 4.043229745169951 | 1.287 | 1.074 | 1.03 |
| 4.046371337823541 | 1.287 | 1.074 | 1.032 |
| 4.049512930477131 | 1.287 | 1.074 | 1.033 |
| 4.05265452313072 | 1.287 | 1.074 | 1.035 |
| 4.05579611578431 | 1.287 | 1.074 | 1.036 |
| 4.0589377084379 | 1.287 | 1.074 | 1.038 |
| 4.062079301091489 | 1.287 | 1.074 | 1.04 |
| 4.065220893745079 | 1.287 | 1.074 | 1.041 |
| 4.068362486398668 | 1.287 | 1.074 | 1.043 |
| 4.071504079052258 | 1.287 | 1.074 | 1.045 |
| 4.074645671705848 | 1.287 | 1.074 | 1.047 |
| 4.077787264359437 | 1.287 | 1.074 | 1.049 |
| 4.080928857013027 | 1.287 | 1.074 | 1.051 |
| 4.084070449666616 | 1.287 | 1.074 | 1.053 |
| 4.087212042320206 | 1.287 | 1.074 | 1.055 |
| 4.090353634973795 | 1.288 | 1.074 | 1.057 |
| 4.093495227627385 | 1.288 | 1.074 | 1.06 |
| 4.096636820280975 | 1.288 | 1.074 | 1.062 |
| 4.099778412934564 | 1.288 | 1.074 | 1.064 |
| 4.102920005588154 | 1.288 | 1.074 | 1.067 |
| 4.106061598241744 | 1.288 | 1.074 | 1.069 |
| 4.109203190895333 | 1.288 | 1.074 | 1.071 |
| 4.112344783548923 | 1.288 | 1.074 | 1.074 |
| 4.115486376202512 | 1.288 | 1.074 | 1.077 |
| 4.118627968856102 | 1.288 | 1.074 | 1.079 |
| 4.121769561509692 | 1.288 | 1.074 | 1.082 |
| 4.124911154163281 | 1.288 | 1.074 | 1.084 |
| 4.128052746816871 | 1.288 | 1.074 | 1.087 |
| 4.13119433947046 | 1.288 | 1.074 | 1.09 |
| 4.13433593212405 | 1.288 | 1.074 | 1.093 |
| 4.13747752477764 | 1.288 | 1.074 | 1.096 |
| 4.14061911743123 | 1.288 | 1.074 | 1.099 |
| 4.143760710084818 | 1.288 | 1.074 | 1.101 |
| 4.146902302738408 | 1.288 | 1.074 | 1.104 |
| 4.150043895391998 | 1.288 | 1.074 | 1.107 |
| 4.153185488045588 | 1.288 | 1.074 | 1.11 |
| 4.156327080699177 | 1.288 | 1.074 | 1.113 |
| 4.159468673352766 | 1.288 | 1.074 | 1.116 |
| 4.162610266006356 | 1.288 | 1.074 | 1.119 |
| 4.165751858659946 | 1.288 | 1.074 | 1.122 |
| 4.168893451313535 | 1.288 | 1.074 | 1.126 |
| 4.172035043967125 | 1.288 | 1.074 | 1.129 |
| 4.175176636620715 | 1.288 | 1.074 | 1.132 |
| 4.178318229274304 | 1.288 | 1.074 | 1.135 |
| 4.181459821927894 | 1.288 | 1.074 | 1.138 |
| 4.184601414581484 | 1.288 | 1.074 | 1.141 |
| 4.187743007235073 | 1.288 | 1.074 | 1.144 |
| 4.190884599888663 | 1.288 | 1.074 | 1.147 |
| 4.194026192542252 | 1.288 | 1.074 | 1.151 |
| 4.197167785195842 | 1.288 | 1.074 | 1.154 |
| 4.200309377849432 | 1.288 | 1.074 | 1.157 |
| 4.203450970503021 | 1.288 | 1.074 | 1.16 |
| 4.206592563156611 | 1.288 | 1.074 | 1.163 |
| 4.2097341558102 | 1.288 | 1.074 | 1.166 |
| 4.21287574846379 | 1.288 | 1.074 | 1.169 |
| 4.21601734111738 | 1.288 | 1.074 | 1.172 |
| 4.21915893377097 | 1.288 | 1.074 | 1.175 |
| 4.222300526424559 | 1.288 | 1.074 | 1.178 |
| 4.225442119078148 | 1.288 | 1.074 | 1.181 |
| 4.228583711731738 | 1.288 | 1.074 | 1.184 |
| 4.231725304385327 | 1.288 | 1.074 | 1.187 |
| 4.234866897038917 | 1.288 | 1.074 | 1.19 |
| 4.238008489692506 | 1.288 | 1.074 | 1.193 |
| 4.241150082346096 | 1.288 | 1.074 | 1.196 |
| 4.244291674999685 | 1.288 | 1.074 | 1.199 |
| 4.247433267653276 | 1.288 | 1.074 | 1.202 |
| 4.250574860306865 | 1.288 | 1.074 | 1.204 |
| 4.253716452960455 | 1.288 | 1.075 | 1.207 |
| 4.256858045614044 | 1.288 | 1.075 | 1.21 |
| 4.259999638267634 | 1.288 | 1.075 | 1.212 |
| 4.263141230921224 | 1.288 | 1.075 | 1.215 |
| 4.266282823574813 | 1.288 | 1.075 | 1.218 |
| 4.269424416228403 | 1.288 | 1.075 | 1.22 |
| 4.272566008881992 | 1.288 | 1.075 | 1.223 |
| 4.275707601535582 | 1.288 | 1.075 | 1.225 |
| 4.27884919418917 | 1.288 | 1.075 | 1.227 |
| 4.28199078684276 | 1.288 | 1.075 | 1.23 |
| 4.285132379496351 | 1.289 | 1.075 | 1.232 |
| 4.28827397214994 | 1.289 | 1.075 | 1.234 |
| 4.29141556480353 | 1.289 | 1.076 | 1.236 |
| 4.294557157457119 | 1.289 | 1.076 | 1.238 |
| 4.29769875011071 | 1.289 | 1.076 | 1.24 |
| 4.300840342764299 | 1.289 | 1.076 | 1.242 |
| 4.303981935417888 | 1.289 | 1.076 | 1.244 |
| 4.307123528071478 | 1.289 | 1.076 | 1.246 |
| 4.310265120725067 | 1.289 | 1.076 | 1.248 |
| 4.313406713378657 | 1.289 | 1.077 | 1.25 |
| 4.316548306032247 | 1.289 | 1.077 | 1.252 |
| 4.319689898685836 | 1.289 | 1.077 | 1.253 |
| 4.322831491339426 | 1.289 | 1.077 | 1.255 |
| 4.325973083993015 | 1.289 | 1.077 | 1.257 |
| 4.329114676646605 | 1.289 | 1.078 | 1.258 |
| 4.332256269300195 | 1.289 | 1.078 | 1.26 |
| 4.335397861953784 | 1.289 | 1.078 | 1.261 |
| 4.338539454607374 | 1.289 | 1.078 | 1.262 |
| 4.341681047260963 | 1.289 | 1.079 | 1.264 |
| 4.344822639914553 | 1.289 | 1.079 | 1.265 |
| 4.347964232568143 | 1.289 | 1.079 | 1.266 |
| 4.351105825221732 | 1.289 | 1.08 | 1.268 |
| 4.354247417875322 | 1.289 | 1.08 | 1.269 |
| 4.357389010528911 | 1.289 | 1.08 | 1.27 |
| 4.360530603182501 | 1.289 | 1.081 | 1.271 |
| 4.36367219583609 | 1.289 | 1.081 | 1.272 |
| 4.36681378848968 | 1.289 | 1.081 | 1.273 |
| 4.36995538114327 | 1.289 | 1.082 | 1.274 |
| 4.373096973796859 | 1.289 | 1.082 | 1.275 |
| 4.376238566450449 | 1.289 | 1.083 | 1.275 |
| 4.379380159104038 | 1.289 | 1.083 | 1.276 |
| 4.382521751757628 | 1.289 | 1.083 | 1.277 |
| 4.385663344411217 | 1.289 | 1.084 | 1.278 |
| 4.388804937064807 | 1.289 | 1.084 | 1.278 |
| 4.391946529718397 | 1.289 | 1.085 | 1.279 |
| 4.395088122371987 | 1.289 | 1.086 | 1.28 |
| 4.398229715025576 | 1.289 | 1.086 | 1.28 |
| 4.401371307679165 | 1.289 | 1.087 | 1.281 |
| 4.404512900332755 | 1.289 | 1.087 | 1.281 |
| 4.407654492986345 | 1.289 | 1.088 | 1.282 |
| 4.410796085639934 | 1.289 | 1.089 | 1.282 |
| 4.413937678293524 | 1.289 | 1.089 | 1.283 |
| 4.417079270947114 | 1.289 | 1.09 | 1.283 |
| 4.420220863600703 | 1.289 | 1.091 | 1.284 |
| 4.423362456254293 | 1.289 | 1.091 | 1.284 |
| 4.426504048907883 | 1.289 | 1.092 | 1.284 |
| 4.429645641561472 | 1.289 | 1.093 | 1.285 |
| 4.432787234215062 | 1.289 | 1.094 | 1.285 |
| 4.435928826868651 | 1.289 | 1.095 | 1.285 |
| 4.43907041952224 | 1.289 | 1.096 | 1.286 |
| 4.44221201217583 | 1.289 | 1.096 | 1.286 |
| 4.44535360482942 | 1.289 | 1.097 | 1.286 |
| 4.44849519748301 | 1.289 | 1.098 | 1.286 |
| 4.4516367901366 | 1.289 | 1.099 | 1.286 |
| 4.454778382790188 | 1.289 | 1.1 | 1.287 |
| 4.457919975443779 | 1.289 | 1.101 | 1.287 |
| 4.461061568097368 | 1.289 | 1.102 | 1.287 |
| 4.464203160750958 | 1.289 | 1.104 | 1.287 |
| 4.467344753404547 | 1.289 | 1.105 | 1.287 |
| 4.470486346058137 | 1.289 | 1.106 | 1.287 |
| 4.473627938711726 | 1.289 | 1.107 | 1.287 |
| 4.476769531365316 | 1.289 | 1.108 | 1.288 |
| 4.479911124018905 | 1.289 | 1.11 | 1.288 |
| 4.483052716672495 | 1.289 | 1.111 | 1.288 |
| 4.486194309326085 | 1.289 | 1.112 | 1.288 |
| 4.489335901979674 | 1.289 | 1.114 | 1.288 |
| 4.492477494633264 | 1.289 | 1.115 | 1.288 |
| 4.495619087286854 | 1.289 | 1.116 | 1.288 |
| 4.498760679940443 | 1.289 | 1.118 | 1.288 |
| 4.501902272594033 | 1.289 | 1.119 | 1.288 |
| 4.505043865247622 | 1.289 | 1.121 | 1.288 |
| 4.508185457901212 | 1.289 | 1.122 | 1.288 |
| 4.511327050554801 | 1.289 | 1.124 | 1.288 |
| 4.514468643208391 | 1.289 | 1.126 | 1.288 |
| 4.517610235861981 | 1.289 | 1.127 | 1.288 |
| 4.520751828515571 | 1.289 | 1.129 | 1.288 |
| 4.52389342116916 | 1.289 | 1.131 | 1.288 |
| 4.52703501382275 | 1.289 | 1.133 | 1.288 |
| 4.530176606476339 | 1.289 | 1.134 | 1.288 |
| 4.533318199129928 | 1.289 | 1.136 | 1.288 |
| 4.536459791783518 | 1.289 | 1.138 | 1.288 |
| 4.539601384437108 | 1.289 | 1.14 | 1.288 |
| 4.542742977090698 | 1.289 | 1.142 | 1.288 |
| 4.545884569744287 | 1.289 | 1.144 | 1.288 |
| 4.549026162397876 | 1.289 | 1.146 | 1.288 |
| 4.552167755051466 | 1.289 | 1.148 | 1.289 |
| 4.555309347705056 | 1.289 | 1.15 | 1.289 |
| 4.558450940358646 | 1.289 | 1.152 | 1.289 |
| 4.561592533012235 | 1.289 | 1.154 | 1.289 |
| 4.564734125665825 | 1.289 | 1.157 | 1.289 |
| 4.567875718319415 | 1.289 | 1.159 | 1.289 |
| 4.571017310973004 | 1.289 | 1.161 | 1.289 |
| 4.574158903626594 | 1.289 | 1.163 | 1.289 |
| 4.577300496280183 | 1.289 | 1.166 | 1.289 |
| 4.580442088933772 | 1.289 | 1.168 | 1.289 |
| 4.583583681587362 | 1.289 | 1.17 | 1.289 |
| 4.586725274240952 | 1.289 | 1.173 | 1.289 |
| 4.589866866894542 | 1.289 | 1.175 | 1.289 |
| 4.593008459548131 | 1.289 | 1.178 | 1.289 |
| 4.596150052201721 | 1.289 | 1.18 | 1.289 |
| 4.59929164485531 | 1.289 | 1.183 | 1.289 |
| 4.6024332375089 | 1.289 | 1.185 | 1.289 |
| 4.60557483016249 | 1.289 | 1.188 | 1.289 |
| 4.608716422816079 | 1.289 | 1.191 | 1.289 |
| 4.611858015469668 | 1.289 | 1.193 | 1.289 |
| 4.614999608123258 | 1.289 | 1.196 | 1.289 |
| 4.618141200776848 | 1.289 | 1.199 | 1.289 |
| 4.621282793430437 | 1.289 | 1.201 | 1.289 |
| 4.624424386084027 | 1.289 | 1.204 | 1.289 |
| 4.627565978737617 | 1.289 | 1.207 | 1.289 |
| 4.630707571391206 | 1.289 | 1.21 | 1.289 |
| 4.633849164044795 | 1.289 | 1.213 | 1.289 |
| 4.636990756698386 | 1.289 | 1.215 | 1.289 |
| 4.640132349351975 | 1.289 | 1.218 | 1.289 |
| 4.643273942005564 | 1.289 | 1.221 | 1.289 |
| 4.646415534659154 | 1.289 | 1.224 | 1.289 |
| 4.649557127312744 | 1.289 | 1.227 | 1.289 |
| 4.652698719966334 | 1.289 | 1.23 | 1.289 |
| 4.655840312619923 | 1.289 | 1.233 | 1.289 |
| 4.658981905273513 | 1.289 | 1.236 | 1.289 |
| 4.662123497927102 | 1.289 | 1.239 | 1.289 |
| 4.665265090580692 | 1.289 | 1.242 | 1.289 |
| 4.668406683234282 | 1.289 | 1.245 | 1.289 |
| 4.671548275887871 | 1.289 | 1.248 | 1.289 |
| 4.674689868541461 | 1.289 | 1.251 | 1.289 |
| 4.67783146119505 | 1.289 | 1.254 | 1.289 |
| 4.68097305384864 | 1.289 | 1.257 | 1.289 |
| 4.68411464650223 | 1.289 | 1.26 | 1.289 |
| 4.687256239155819 | 1.289 | 1.263 | 1.289 |
| 4.690397831809409 | 1.289 | 1.267 | 1.289 |
| 4.693539424462998 | 1.289 | 1.27 | 1.289 |
| 4.696681017116588 | 1.289 | 1.273 | 1.289 |
| 4.699822609770177 | 1.289 | 1.276 | 1.289 |
| 4.702964202423767 | 1.289 | 1.279 | 1.289 |
| 4.706105795077356 | 1.289 | 1.282 | 1.289 |
| 4.709247387730946 | 1.289 | 1.285 | 1.289 |
| 4.712388980384535 | 1.289 | 1.289 | 1.289 |
| 4.715530573038126 | 1.289 | 1.292 | 1.289 |
| 4.718672165691715 | 1.289 | 1.295 | 1.289 |
| 4.721813758345305 | 1.289 | 1.298 | 1.289 |
| 4.724955350998894 | 1.289 | 1.301 | 1.289 |
| 4.728096943652484 | 1.289 | 1.304 | 1.289 |
| 4.731238536306074 | 1.289 | 1.307 | 1.289 |
| 4.734380128959663 | 1.289 | 1.31 | 1.289 |
| 4.737521721613253 | 1.289 | 1.314 | 1.289 |
| 4.740663314266842 | 1.289 | 1.317 | 1.289 |
| 4.743804906920432 | 1.289 | 1.32 | 1.289 |
| 4.74694649957402 | 1.289 | 1.323 | 1.289 |
| 4.750088092227611 | 1.289 | 1.326 | 1.289 |
| 4.7532296848812 | 1.289 | 1.329 | 1.289 |
| 4.75637127753479 | 1.289 | 1.332 | 1.289 |
| 4.75951287018838 | 1.289 | 1.335 | 1.289 |
| 4.76265446284197 | 1.289 | 1.338 | 1.289 |
| 4.765796055495559 | 1.289 | 1.341 | 1.289 |
| 4.768937648149149 | 1.289 | 1.344 | 1.289 |
| 4.772079240802738 | 1.289 | 1.347 | 1.289 |
| 4.775220833456327 | 1.289 | 1.35 | 1.289 |
| 4.778362426109917 | 1.289 | 1.353 | 1.289 |
| 4.781504018763507 | 1.289 | 1.356 | 1.289 |
| 4.784645611417097 | 1.289 | 1.359 | 1.289 |
| 4.787787204070686 | 1.289 | 1.362 | 1.289 |
| 4.790928796724275 | 1.289 | 1.365 | 1.289 |
| 4.794070389377865 | 1.289 | 1.367 | 1.289 |
| 4.797211982031455 | 1.289 | 1.37 | 1.289 |
| 4.800353574685045 | 1.289 | 1.373 | 1.289 |
| 4.803495167338634 | 1.289 | 1.376 | 1.289 |
| 4.806636759992224 | 1.289 | 1.378 | 1.289 |
| 4.809778352645814 | 1.289 | 1.381 | 1.289 |
| 4.812919945299403 | 1.289 | 1.384 | 1.289 |
| 4.816061537952993 | 1.289 | 1.387 | 1.289 |
| 4.819203130606582 | 1.289 | 1.389 | 1.289 |
| 4.822344723260172 | 1.289 | 1.392 | 1.289 |
| 4.825486315913761 | 1.289 | 1.394 | 1.289 |
| 4.828627908567351 | 1.289 | 1.397 | 1.289 |
| 4.83176950122094 | 1.289 | 1.399 | 1.289 |
| 4.83491109387453 | 1.289 | 1.402 | 1.289 |
| 4.83805268652812 | 1.289 | 1.404 | 1.289 |
| 4.841194279181709 | 1.289 | 1.407 | 1.289 |
| 4.844335871835299 | 1.289 | 1.409 | 1.289 |
| 4.847477464488889 | 1.289 | 1.411 | 1.289 |
| 4.850619057142478 | 1.289 | 1.414 | 1.289 |
| 4.853760649796068 | 1.289 | 1.416 | 1.289 |
| 4.856902242449657 | 1.289 | 1.418 | 1.289 |
| 4.860043835103247 | 1.289 | 1.421 | 1.289 |
| 4.863185427756837 | 1.289 | 1.423 | 1.289 |
| 4.866327020410426 | 1.289 | 1.425 | 1.289 |
| 4.869468613064015 | 1.289 | 1.427 | 1.289 |
| 4.872610205717605 | 1.289 | 1.429 | 1.289 |
| 4.875751798371195 | 1.289 | 1.431 | 1.289 |
| 4.878893391024784 | 1.289 | 1.433 | 1.289 |
| 4.882034983678374 | 1.289 | 1.435 | 1.289 |
| 4.885176576331964 | 1.289 | 1.437 | 1.289 |
| 4.888318168985553 | 1.289 | 1.439 | 1.289 |
| 4.891459761639143 | 1.289 | 1.441 | 1.289 |
| 4.894601354292733 | 1.289 | 1.443 | 1.289 |
| 4.897742946946322 | 1.289 | 1.445 | 1.289 |
| 4.900884539599912 | 1.289 | 1.446 | 1.289 |
| 4.904026132253501 | 1.289 | 1.448 | 1.289 |
| 4.907167724907091 | 1.289 | 1.45 | 1.289 |
| 4.91030931756068 | 1.289 | 1.451 | 1.289 |
| 4.91345091021427 | 1.289 | 1.453 | 1.289 |
| 4.91659250286786 | 1.289 | 1.455 | 1.289 |
| 4.91973409552145 | 1.289 | 1.456 | 1.289 |
| 4.922875688175039 | 1.289 | 1.458 | 1.289 |
| 4.926017280828628 | 1.289 | 1.459 | 1.289 |
| 4.929158873482218 | 1.289 | 1.461 | 1.289 |
| 4.932300466135808 | 1.289 | 1.462 | 1.289 |
| 4.935442058789397 | 1.289 | 1.464 | 1.289 |
| 4.938583651442987 | 1.289 | 1.465 | 1.289 |
| 4.941725244096576 | 1.289 | 1.466 | 1.289 |
| 4.944866836750166 | 1.289 | 1.468 | 1.289 |
| 4.948008429403755 | 1.289 | 1.469 | 1.289 |
| 4.951150022057345 | 1.289 | 1.47 | 1.29 |
| 4.954291614710935 | 1.289 | 1.471 | 1.29 |
| 4.957433207364524 | 1.289 | 1.472 | 1.29 |
| 4.960574800018114 | 1.289 | 1.474 | 1.29 |
| 4.963716392671704 | 1.289 | 1.475 | 1.29 |
| 4.966857985325293 | 1.289 | 1.476 | 1.29 |
| 4.969999577978883 | 1.289 | 1.477 | 1.29 |
| 4.973141170632472 | 1.289 | 1.478 | 1.291 |
| 4.976282763286062 | 1.289 | 1.479 | 1.291 |
| 4.979424355939651 | 1.289 | 1.48 | 1.291 |
| 4.982565948593241 | 1.289 | 1.481 | 1.291 |
| 4.985707541246831 | 1.289 | 1.482 | 1.292 |
| 4.98884913390042 | 1.289 | 1.482 | 1.292 |
| 4.99199072655401 | 1.289 | 1.483 | 1.292 |
| 4.9951323192076 | 1.289 | 1.484 | 1.292 |
| 4.99827391186119 | 1.289 | 1.485 | 1.293 |
| 5.00141550451478 | 1.289 | 1.486 | 1.293 |
| 5.004557097168369 | 1.289 | 1.486 | 1.293 |
| 5.007698689821958 | 1.289 | 1.487 | 1.294 |
| 5.010840282475548 | 1.289 | 1.488 | 1.294 |
| 5.013981875129137 | 1.289 | 1.489 | 1.295 |
| 5.017123467782727 | 1.289 | 1.489 | 1.295 |
| 5.020265060436317 | 1.289 | 1.49 | 1.296 |
| 5.023406653089906 | 1.289 | 1.49 | 1.296 |
| 5.026548245743496 | 1.289 | 1.491 | 1.297 |
| 5.029689838397085 | 1.289 | 1.492 | 1.297 |
| 5.032831431050674 | 1.289 | 1.492 | 1.298 |
| 5.035973023704264 | 1.289 | 1.493 | 1.299 |
| 5.039114616357854 | 1.289 | 1.493 | 1.299 |
| 5.042256209011444 | 1.289 | 1.494 | 1.3 |
| 5.045397801665033 | 1.289 | 1.494 | 1.301 |
| 5.048539394318622 | 1.289 | 1.495 | 1.302 |
| 5.051680986972213 | 1.289 | 1.495 | 1.302 |
| 5.054822579625802 | 1.289 | 1.495 | 1.303 |
| 5.057964172279392 | 1.289 | 1.496 | 1.304 |
| 5.061105764932981 | 1.289 | 1.496 | 1.305 |
| 5.064247357586571 | 1.289 | 1.497 | 1.306 |
| 5.067388950240161 | 1.289 | 1.497 | 1.307 |
| 5.07053054289375 | 1.289 | 1.497 | 1.308 |
| 5.07367213554734 | 1.289 | 1.498 | 1.31 |
| 5.07681372820093 | 1.289 | 1.498 | 1.311 |
| 5.079955320854519 | 1.289 | 1.498 | 1.312 |
| 5.083096913508108 | 1.289 | 1.498 | 1.313 |
| 5.086238506161698 | 1.289 | 1.499 | 1.315 |
| 5.089380098815288 | 1.289 | 1.499 | 1.316 |
| 5.092521691468877 | 1.289 | 1.499 | 1.317 |
| 5.095663284122466 | 1.289 | 1.499 | 1.319 |
| 5.098804876776057 | 1.289 | 1.5 | 1.32 |
| 5.101946469429646 | 1.289 | 1.5 | 1.322 |
| 5.105088062083236 | 1.289 | 1.5 | 1.324 |
| 5.108229654736825 | 1.289 | 1.5 | 1.325 |
| 5.111371247390415 | 1.289 | 1.5 | 1.327 |
| 5.114512840044005 | 1.289 | 1.501 | 1.329 |
| 5.117654432697594 | 1.289 | 1.501 | 1.331 |
| 5.120796025351184 | 1.289 | 1.501 | 1.333 |
| 5.123937618004773 | 1.289 | 1.501 | 1.335 |
| 5.127079210658363 | 1.289 | 1.501 | 1.337 |
| 5.130220803311953 | 1.289 | 1.501 | 1.339 |
| 5.133362395965542 | 1.289 | 1.501 | 1.341 |
| 5.136503988619131 | 1.289 | 1.502 | 1.343 |
| 5.13964558127272 | 1.289 | 1.502 | 1.345 |
| 5.142787173926311 | 1.289 | 1.502 | 1.347 |
| 5.1459287665799 | 1.289 | 1.502 | 1.35 |
| 5.14907035923349 | 1.289 | 1.502 | 1.352 |
| 5.15221195188708 | 1.289 | 1.502 | 1.355 |
| 5.15535354454067 | 1.289 | 1.502 | 1.357 |
| 5.158495137194259 | 1.289 | 1.502 | 1.359 |
| 5.161636729847848 | 1.289 | 1.502 | 1.362 |
| 5.164778322501438 | 1.289 | 1.502 | 1.365 |
| 5.167919915155028 | 1.289 | 1.502 | 1.367 |
| 5.171061507808617 | 1.289 | 1.503 | 1.37 |
| 5.174203100462206 | 1.289 | 1.503 | 1.373 |
| 5.177344693115796 | 1.289 | 1.503 | 1.375 |
| 5.180486285769386 | 1.289 | 1.503 | 1.378 |
| 5.183627878422976 | 1.289 | 1.503 | 1.381 |
| 5.186769471076565 | 1.289 | 1.503 | 1.384 |
| 5.189911063730155 | 1.289 | 1.503 | 1.387 |
| 5.193052656383744 | 1.289 | 1.503 | 1.39 |
| 5.196194249037334 | 1.289 | 1.503 | 1.393 |
| 5.199335841690924 | 1.289 | 1.503 | 1.396 |
| 5.202477434344513 | 1.289 | 1.503 | 1.399 |
| 5.205619026998103 | 1.289 | 1.503 | 1.402 |
| 5.208760619651692 | 1.289 | 1.503 | 1.405 |
| 5.211902212305282 | 1.289 | 1.503 | 1.408 |
| 5.215043804958871 | 1.289 | 1.503 | 1.411 |
| 5.218185397612461 | 1.289 | 1.503 | 1.414 |
| 5.221326990266051 | 1.289 | 1.503 | 1.417 |
| 5.22446858291964 | 1.289 | 1.503 | 1.42 |
| 5.22761017557323 | 1.289 | 1.503 | 1.423 |
| 5.23075176822682 | 1.289 | 1.503 | 1.426 |
| 5.23389336088041 | 1.289 | 1.503 | 1.43 |
| 5.237034953533999 | 1.289 | 1.503 | 1.433 |
| 5.240176546187588 | 1.289 | 1.503 | 1.436 |
| 5.243318138841178 | 1.289 | 1.503 | 1.439 |
| 5.246459731494767 | 1.289 | 1.503 | 1.442 |
| 5.249601324148357 | 1.289 | 1.503 | 1.445 |
| 5.252742916801947 | 1.289 | 1.503 | 1.448 |
| 5.255884509455536 | 1.289 | 1.503 | 1.452 |
| 5.259026102109125 | 1.289 | 1.503 | 1.455 |
| 5.262167694762715 | 1.289 | 1.503 | 1.458 |
| 5.265309287416305 | 1.289 | 1.503 | 1.461 |
| 5.268450880069895 | 1.289 | 1.503 | 1.464 |
| 5.271592472723484 | 1.289 | 1.503 | 1.467 |
| 5.274734065377074 | 1.289 | 1.503 | 1.47 |
| 5.277875658030664 | 1.289 | 1.503 | 1.473 |
| 5.281017250684253 | 1.289 | 1.503 | 1.476 |
| 5.284158843337843 | 1.289 | 1.503 | 1.479 |
| 5.287300435991432 | 1.289 | 1.503 | 1.481 |
| 5.290442028645022 | 1.289 | 1.503 | 1.484 |
| 5.293583621298612 | 1.289 | 1.503 | 1.487 |
| 5.296725213952201 | 1.289 | 1.503 | 1.49 |
| 5.299866806605791 | 1.289 | 1.503 | 1.493 |
| 5.30300839925938 | 1.289 | 1.503 | 1.495 |
| 5.30614999191297 | 1.289 | 1.503 | 1.498 |
| 5.30929158456656 | 1.289 | 1.503 | 1.501 |
| 5.312433177220149 | 1.289 | 1.503 | 1.503 |
| 5.315574769873739 | 1.289 | 1.503 | 1.506 |
| 5.318716362527328 | 1.289 | 1.503 | 1.508 |
| 5.321857955180918 | 1.289 | 1.503 | 1.511 |
| 5.324999547834508 | 1.289 | 1.503 | 1.513 |
| 5.328141140488097 | 1.289 | 1.503 | 1.515 |
| 5.331282733141686 | 1.29 | 1.503 | 1.518 |
| 5.334424325795276 | 1.29 | 1.503 | 1.52 |
| 5.337565918448866 | 1.29 | 1.503 | 1.522 |
| 5.340707511102456 | 1.29 | 1.503 | 1.524 |
| 5.343849103756045 | 1.29 | 1.503 | 1.526 |
| 5.346990696409634 | 1.29 | 1.503 | 1.528 |
| 5.350132289063224 | 1.29 | 1.503 | 1.53 |
| 5.353273881716814 | 1.29 | 1.503 | 1.532 |
| 5.356415474370403 | 1.29 | 1.503 | 1.534 |
| 5.359557067023993 | 1.29 | 1.503 | 1.536 |
| 5.362698659677583 | 1.29 | 1.503 | 1.537 |
| 5.365840252331172 | 1.29 | 1.503 | 1.539 |
| 5.368981844984762 | 1.29 | 1.503 | 1.541 |
| 5.372123437638351 | 1.29 | 1.503 | 1.542 |
| 5.375265030291941 | 1.29 | 1.503 | 1.544 |
| 5.378406622945531 | 1.29 | 1.503 | 1.546 |
| 5.38154821559912 | 1.29 | 1.503 | 1.547 |
| 5.38468980825271 | 1.29 | 1.503 | 1.548 |
| 5.387831400906299 | 1.291 | 1.503 | 1.55 |
| 5.39097299355989 | 1.291 | 1.503 | 1.551 |
| 5.394114586213479 | 1.291 | 1.503 | 1.552 |
| 5.397256178867068 | 1.291 | 1.503 | 1.553 |
| 5.400397771520657 | 1.291 | 1.503 | 1.555 |
| 5.403539364174247 | 1.291 | 1.503 | 1.556 |
| 5.406680956827837 | 1.291 | 1.503 | 1.557 |
| 5.409822549481426 | 1.291 | 1.503 | 1.558 |
| 5.412964142135016 | 1.291 | 1.503 | 1.559 |
| 5.416105734788605 | 1.291 | 1.503 | 1.56 |
| 5.419247327442195 | 1.291 | 1.503 | 1.561 |
| 5.422388920095785 | 1.291 | 1.503 | 1.562 |
| 5.425530512749375 | 1.292 | 1.503 | 1.562 |
| 5.428672105402964 | 1.292 | 1.503 | 1.563 |
| 5.431813698056554 | 1.292 | 1.503 | 1.564 |
| 5.434955290710143 | 1.292 | 1.503 | 1.565 |
| 5.438096883363733 | 1.292 | 1.503 | 1.565 |
| 5.441238476017322 | 1.292 | 1.503 | 1.566 |
| 5.444380068670912 | 1.292 | 1.503 | 1.567 |
| 5.447521661324502 | 1.292 | 1.503 | 1.567 |
| 5.450663253978091 | 1.293 | 1.503 | 1.568 |
| 5.453804846631681 | 1.293 | 1.503 | 1.568 |
| 5.456946439285271 | 1.293 | 1.503 | 1.569 |
| 5.46008803193886 | 1.293 | 1.503 | 1.569 |
| 5.46322962459245 | 1.293 | 1.503 | 1.569 |
| 5.466371217246039 | 1.293 | 1.503 | 1.57 |
| 5.46951280989963 | 1.293 | 1.503 | 1.57 |
| 5.472654402553218 | 1.294 | 1.503 | 1.571 |
| 5.475795995206808 | 1.294 | 1.503 | 1.571 |
| 5.478937587860398 | 1.294 | 1.503 | 1.571 |
| 5.482079180513987 | 1.294 | 1.503 | 1.572 |
| 5.485220773167577 | 1.294 | 1.503 | 1.572 |
| 5.488362365821166 | 1.294 | 1.503 | 1.572 |
| 5.491503958474756 | 1.295 | 1.503 | 1.572 |
| 5.494645551128346 | 1.295 | 1.503 | 1.573 |
| 5.497787143781935 | 1.295 | 1.503 | 1.573 |
| 5.500928736435525 | 1.295 | 1.503 | 1.573 |
| 5.504070329089115 | 1.295 | 1.503 | 1.573 |
| 5.507211921742704 | 1.296 | 1.503 | 1.573 |
| 5.510353514396294 | 1.296 | 1.503 | 1.573 |
| 5.513495107049883 | 1.296 | 1.503 | 1.574 |
| 5.516636699703473 | 1.296 | 1.503 | 1.574 |
| 5.519778292357062 | 1.296 | 1.503 | 1.574 |
| 5.522919885010652 | 1.297 | 1.503 | 1.574 |
| 5.526061477664242 | 1.297 | 1.503 | 1.574 |
| 5.529203070317831 | 1.297 | 1.503 | 1.574 |
| 5.532344662971421 | 1.297 | 1.503 | 1.574 |
| 5.535486255625011 | 1.298 | 1.503 | 1.574 |
| 5.5386278482786 | 1.298 | 1.503 | 1.574 |
| 5.54176944093219 | 1.298 | 1.503 | 1.574 |
| 5.544911033585779 | 1.299 | 1.503 | 1.574 |
| 5.54805262623937 | 1.299 | 1.503 | 1.574 |
| 5.551194218892959 | 1.299 | 1.503 | 1.575 |
| 5.554335811546548 | 1.299 | 1.503 | 1.575 |
| 5.557477404200137 | 1.3 | 1.503 | 1.575 |
| 5.560618996853727 | 1.3 | 1.503 | 1.575 |
| 5.563760589507317 | 1.3 | 1.503 | 1.575 |
| 5.566902182160906 | 1.301 | 1.503 | 1.575 |
| 5.570043774814496 | 1.301 | 1.503 | 1.575 |
| 5.573185367468086 | 1.301 | 1.503 | 1.575 |
| 5.576326960121675 | 1.302 | 1.503 | 1.575 |
| 5.579468552775264 | 1.302 | 1.503 | 1.575 |
| 5.582610145428854 | 1.302 | 1.503 | 1.575 |
| 5.585751738082444 | 1.303 | 1.503 | 1.575 |
| 5.588893330736034 | 1.303 | 1.503 | 1.575 |
| 5.592034923389623 | 1.304 | 1.503 | 1.575 |
| 5.595176516043213 | 1.304 | 1.503 | 1.575 |
| 5.598318108696803 | 1.304 | 1.503 | 1.575 |
| 5.601459701350392 | 1.305 | 1.503 | 1.575 |
| 5.604601294003982 | 1.305 | 1.503 | 1.575 |
| 5.607742886657571 | 1.306 | 1.503 | 1.575 |
| 5.610884479311161 | 1.306 | 1.503 | 1.575 |
| 5.61402607196475 | 1.306 | 1.503 | 1.575 |
| 5.61716766461834 | 1.307 | 1.503 | 1.575 |
| 5.62030925727193 | 1.307 | 1.503 | 1.575 |
| 5.623450849925519 | 1.308 | 1.503 | 1.575 |
| 5.626592442579109 | 1.308 | 1.503 | 1.575 |
| 5.629734035232698 | 1.309 | 1.503 | 1.575 |
| 5.632875627886288 | 1.309 | 1.503 | 1.575 |
| 5.636017220539878 | 1.31 | 1.503 | 1.575 |
| 5.639158813193467 | 1.31 | 1.503 | 1.575 |
| 5.642300405847057 | 1.311 | 1.503 | 1.575 |
| 5.645441998500646 | 1.311 | 1.503 | 1.575 |
| 5.648583591154236 | 1.312 | 1.503 | 1.575 |
| 5.651725183807825 | 1.313 | 1.503 | 1.575 |
| 5.654866776461415 | 1.313 | 1.503 | 1.575 |
| 5.658008369115005 | 1.314 | 1.503 | 1.575 |
| 5.661149961768594 | 1.314 | 1.503 | 1.575 |
| 5.664291554422184 | 1.315 | 1.503 | 1.575 |
| 5.667433147075774 | 1.316 | 1.503 | 1.575 |
| 5.670574739729363 | 1.316 | 1.503 | 1.575 |
| 5.673716332382953 | 1.317 | 1.503 | 1.575 |
| 5.676857925036542 | 1.317 | 1.503 | 1.575 |
| 5.679999517690132 | 1.318 | 1.503 | 1.575 |
| 5.683141110343721 | 1.319 | 1.503 | 1.575 |
| 5.686282702997311 | 1.319 | 1.503 | 1.575 |
| 5.689424295650901 | 1.32 | 1.503 | 1.575 |
| 5.69256588830449 | 1.321 | 1.503 | 1.575 |
| 5.69570748095808 | 1.322 | 1.503 | 1.575 |
| 5.69884907361167 | 1.322 | 1.503 | 1.575 |
| 5.701990666265259 | 1.323 | 1.503 | 1.575 |
| 5.705132258918849 | 1.324 | 1.503 | 1.575 |
| 5.708273851572438 | 1.325 | 1.503 | 1.575 |
| 5.711415444226028 | 1.325 | 1.503 | 1.575 |
| 5.714557036879618 | 1.326 | 1.503 | 1.575 |
| 5.717698629533207 | 1.327 | 1.503 | 1.575 |
| 5.720840222186797 | 1.328 | 1.503 | 1.575 |
| 5.723981814840386 | 1.329 | 1.503 | 1.575 |
| 5.727123407493976 | 1.329 | 1.503 | 1.575 |
| 5.730265000147565 | 1.33 | 1.503 | 1.575 |
| 5.733406592801155 | 1.331 | 1.503 | 1.575 |
| 5.736548185454744 | 1.332 | 1.503 | 1.575 |
| 5.739689778108334 | 1.333 | 1.503 | 1.575 |
| 5.742831370761924 | 1.334 | 1.503 | 1.575 |
| 5.745972963415514 | 1.335 | 1.503 | 1.575 |
| 5.749114556069103 | 1.336 | 1.503 | 1.575 |
| 5.752256148722693 | 1.337 | 1.503 | 1.575 |
| 5.755397741376282 | 1.338 | 1.503 | 1.575 |
| 5.758539334029872 | 1.339 | 1.503 | 1.575 |
| 5.761680926683462 | 1.34 | 1.503 | 1.575 |
| 5.764822519337051 | 1.341 | 1.503 | 1.575 |
| 5.767964111990641 | 1.342 | 1.503 | 1.575 |
| 5.77110570464423 | 1.343 | 1.503 | 1.575 |
| 5.77424729729782 | 1.344 | 1.503 | 1.575 |
| 5.77738888995141 | 1.345 | 1.504 | 1.575 |
| 5.780530482605 | 1.346 | 1.504 | 1.575 |
| 5.783672075258588 | 1.347 | 1.504 | 1.575 |
| 5.786813667912178 | 1.348 | 1.504 | 1.575 |
| 5.789955260565768 | 1.349 | 1.504 | 1.575 |
| 5.793096853219358 | 1.35 | 1.504 | 1.575 |
| 5.796238445872947 | 1.352 | 1.504 | 1.575 |
| 5.799380038526537 | 1.353 | 1.504 | 1.575 |
| 5.802521631180126 | 1.354 | 1.504 | 1.575 |
| 5.805663223833715 | 1.355 | 1.504 | 1.575 |
| 5.808804816487306 | 1.356 | 1.504 | 1.575 |
| 5.811946409140895 | 1.358 | 1.504 | 1.575 |
| 5.815088001794485 | 1.359 | 1.504 | 1.575 |
| 5.818229594448074 | 1.36 | 1.504 | 1.575 |
| 5.821371187101663 | 1.361 | 1.504 | 1.575 |
| 5.824512779755254 | 1.363 | 1.504 | 1.575 |
| 5.827654372408843 | 1.364 | 1.504 | 1.575 |
| 5.830795965062433 | 1.365 | 1.504 | 1.575 |
| 5.833937557716022 | 1.367 | 1.504 | 1.575 |
| 5.837079150369612 | 1.368 | 1.504 | 1.575 |
| 5.840220743023201 | 1.369 | 1.504 | 1.575 |
| 5.843362335676791 | 1.371 | 1.504 | 1.575 |
| 5.846503928330381 | 1.372 | 1.505 | 1.575 |
| 5.84964552098397 | 1.374 | 1.505 | 1.575 |
| 5.85278711363756 | 1.375 | 1.505 | 1.575 |
| 5.85592870629115 | 1.377 | 1.505 | 1.575 |
| 5.85907029894474 | 1.378 | 1.505 | 1.575 |
| 5.862211891598329 | 1.38 | 1.505 | 1.575 |
| 5.865353484251918 | 1.381 | 1.505 | 1.575 |
| 5.868495076905508 | 1.383 | 1.505 | 1.575 |
| 5.871636669559098 | 1.384 | 1.505 | 1.575 |
| 5.874778262212687 | 1.386 | 1.506 | 1.575 |
| 5.877919854866277 | 1.387 | 1.506 | 1.575 |
| 5.881061447519866 | 1.389 | 1.506 | 1.575 |
| 5.884203040173456 | 1.391 | 1.506 | 1.575 |
| 5.887344632827046 | 1.392 | 1.506 | 1.575 |
| 5.890486225480635 | 1.394 | 1.507 | 1.575 |
| 5.893627818134224 | 1.396 | 1.507 | 1.575 |
| 5.896769410787814 | 1.397 | 1.507 | 1.575 |
| 5.899911003441404 | 1.399 | 1.507 | 1.575 |
| 5.903052596094994 | 1.401 | 1.507 | 1.575 |
| 5.906194188748583 | 1.403 | 1.508 | 1.575 |
| 5.909335781402172 | 1.404 | 1.508 | 1.575 |
| 5.912477374055762 | 1.406 | 1.508 | 1.575 |
| 5.915618966709352 | 1.408 | 1.508 | 1.575 |
| 5.918760559362942 | 1.41 | 1.509 | 1.575 |
| 5.921902152016531 | 1.411 | 1.509 | 1.575 |
| 5.92504374467012 | 1.413 | 1.509 | 1.575 |
| 5.92818533732371 | 1.415 | 1.51 | 1.575 |
| 5.9313269299773 | 1.417 | 1.51 | 1.575 |
| 5.93446852263089 | 1.419 | 1.51 | 1.575 |
| 5.93761011528448 | 1.421 | 1.511 | 1.575 |
| 5.940751707938068 | 1.423 | 1.511 | 1.575 |
| 5.943893300591658 | 1.425 | 1.512 | 1.575 |
| 5.947034893245248 | 1.427 | 1.512 | 1.575 |
| 5.950176485898837 | 1.429 | 1.512 | 1.575 |
| 5.953318078552427 | 1.431 | 1.513 | 1.575 |
| 5.956459671206017 | 1.433 | 1.513 | 1.575 |
| 5.959601263859606 | 1.435 | 1.514 | 1.575 |
| 5.962742856513196 | 1.437 | 1.514 | 1.575 |
| 5.965884449166785 | 1.439 | 1.515 | 1.575 |
| 5.969026041820375 | 1.441 | 1.516 | 1.575 |
| 5.972167634473964 | 1.443 | 1.516 | 1.575 |
| 5.975309227127554 | 1.445 | 1.517 | 1.575 |
| 5.978450819781144 | 1.447 | 1.517 | 1.575 |
| 5.981592412434733 | 1.45 | 1.518 | 1.575 |
| 5.984734005088323 | 1.452 | 1.519 | 1.576 |
| 5.987875597741913 | 1.454 | 1.519 | 1.576 |
| 5.991017190395502 | 1.456 | 1.52 | 1.576 |
| 5.994158783049092 | 1.458 | 1.521 | 1.576 |
| 5.997300375702681 | 1.461 | 1.522 | 1.576 |
| 6.000441968356271 | 1.463 | 1.522 | 1.576 |
| 6.003583561009861 | 1.465 | 1.523 | 1.576 |
| 6.00672515366345 | 1.468 | 1.524 | 1.576 |
| 6.00986674631704 | 1.47 | 1.525 | 1.576 |
| 6.01300833897063 | 1.472 | 1.526 | 1.577 |
| 6.01614993162422 | 1.475 | 1.527 | 1.577 |
| 6.019291524277808 | 1.477 | 1.528 | 1.577 |
| 6.022433116931398 | 1.479 | 1.529 | 1.577 |
| 6.025574709584988 | 1.482 | 1.53 | 1.577 |
| 6.028716302238577 | 1.484 | 1.531 | 1.578 |
| 6.031857894892167 | 1.486 | 1.532 | 1.578 |
| 6.034999487545757 | 1.489 | 1.533 | 1.578 |
| 6.038141080199346 | 1.491 | 1.534 | 1.578 |
| 6.041282672852935 | 1.494 | 1.535 | 1.579 |
| 6.044424265506525 | 1.496 | 1.537 | 1.579 |
| 6.047565858160115 | 1.499 | 1.538 | 1.579 |
| 6.050707450813704 | 1.501 | 1.539 | 1.58 |
| 6.053849043467294 | 1.504 | 1.54 | 1.58 |
| 6.056990636120884 | 1.506 | 1.542 | 1.58 |
| 6.060132228774473 | 1.509 | 1.543 | 1.581 |
| 6.063273821428063 | 1.512 | 1.544 | 1.581 |
| 6.066415414081653 | 1.514 | 1.546 | 1.582 |
| 6.069557006735242 | 1.517 | 1.547 | 1.582 |
| 6.072698599388831 | 1.519 | 1.549 | 1.583 |
| 6.07584019204242 | 1.522 | 1.55 | 1.583 |
| 6.078981784696011 | 1.525 | 1.552 | 1.584 |
| 6.082123377349601 | 1.527 | 1.554 | 1.585 |
| 6.08526497000319 | 1.53 | 1.555 | 1.585 |
| 6.08840656265678 | 1.533 | 1.557 | 1.586 |
| 6.09154815531037 | 1.535 | 1.559 | 1.587 |
| 6.094689747963959 | 1.538 | 1.56 | 1.588 |
| 6.097831340617549 | 1.541 | 1.562 | 1.589 |
| 6.100972933271138 | 1.544 | 1.564 | 1.589 |
| 6.104114525924728 | 1.546 | 1.566 | 1.59 |
| 6.107256118578317 | 1.549 | 1.568 | 1.591 |
| 6.110397711231907 | 1.552 | 1.569 | 1.592 |
| 6.113539303885497 | 1.555 | 1.571 | 1.593 |
| 6.116680896539086 | 1.558 | 1.573 | 1.594 |
| 6.119822489192675 | 1.56 | 1.575 | 1.595 |
| 6.122964081846265 | 1.563 | 1.577 | 1.597 |
| 6.126105674499855 | 1.566 | 1.58 | 1.598 |
| 6.129247267153445 | 1.569 | 1.582 | 1.599 |
| 6.132388859807034 | 1.572 | 1.584 | 1.6 |
| 6.135530452460624 | 1.575 | 1.586 | 1.602 |
| 6.138672045114213 | 1.577 | 1.588 | 1.603 |
| 6.141813637767803 | 1.58 | 1.591 | 1.605 |
| 6.144955230421393 | 1.583 | 1.593 | 1.606 |
| 6.148096823074982 | 1.586 | 1.595 | 1.608 |
| 6.151238415728571 | 1.589 | 1.597 | 1.609 |
| 6.154380008382161 | 1.592 | 1.6 | 1.611 |
| 6.157521601035751 | 1.595 | 1.602 | 1.613 |
| 6.16066319368934 | 1.598 | 1.605 | 1.615 |
| 6.16380478634293 | 1.601 | 1.607 | 1.616 |
| 6.16694637899652 | 1.604 | 1.61 | 1.618 |
| 6.170087971650109 | 1.607 | 1.612 | 1.62 |
| 6.173229564303698 | 1.61 | 1.615 | 1.622 |
| 6.176371156957289 | 1.613 | 1.617 | 1.624 |
| 6.179512749610878 | 1.616 | 1.62 | 1.626 |
| 6.182654342264468 | 1.619 | 1.623 | 1.629 |
| 6.185795934918057 | 1.622 | 1.625 | 1.631 |
| 6.188937527571647 | 1.625 | 1.628 | 1.633 |
| 6.192079120225237 | 1.628 | 1.631 | 1.635 |
| 6.195220712878826 | 1.631 | 1.634 | 1.638 |
| 6.198362305532415 | 1.634 | 1.636 | 1.64 |
| 6.201503898186005 | 1.637 | 1.639 | 1.643 |
| 6.204645490839594 | 1.64 | 1.642 | 1.645 |
| 6.207787083493184 | 1.643 | 1.645 | 1.648 |
| 6.210928676146774 | 1.646 | 1.648 | 1.65 |
| 6.214070268800364 | 1.649 | 1.651 | 1.653 |
| 6.217211861453953 | 1.652 | 1.654 | 1.655 |
| 6.220353454107543 | 1.656 | 1.657 | 1.658 |
| 6.223495046761133 | 1.659 | 1.659 | 1.661 |
| 6.226636639414722 | 1.662 | 1.662 | 1.664 |
| 6.229778232068312 | 1.665 | 1.665 | 1.666 |
| 6.232919824721901 | 1.668 | 1.668 | 1.669 |
| 6.236061417375491 | 1.671 | 1.671 | 1.672 |
| 6.23920301002908 | 1.674 | 1.675 | 1.675 |
| 6.24234460268267 | 1.677 | 1.678 | 1.678 |
| 6.24548619533626 | 1.68 | 1.681 | 1.681 |
| 6.24862778798985 | 1.684 | 1.684 | 1.684 |
| 6.251769380643438 | 1.687 | 1.687 | 1.687 |
| 6.254910973297028 | 1.69 | 1.69 | 1.69 |
| 6.258052565950618 | 1.693 | 1.693 | 1.693 |
| 6.261194158604208 | 1.696 | 1.696 | 1.696 |
| 6.264335751257797 | 1.699 | 1.699 | 1.699 |
| 6.267477343911387 | 1.702 | 1.702 | 1.702 |
| 6.270618936564976 | 1.705 | 1.706 | 1.706 |
| 6.273760529218566 | 1.709 | 1.709 | 1.709 |
| 6.276902121872155 | 1.712 | 1.712 | 1.712 |
| 6.280043714525745 | 1.715 | 1.715 | 1.715 |
| 6.283185307179335 | 1.718 | 1.718 | 1.718 |